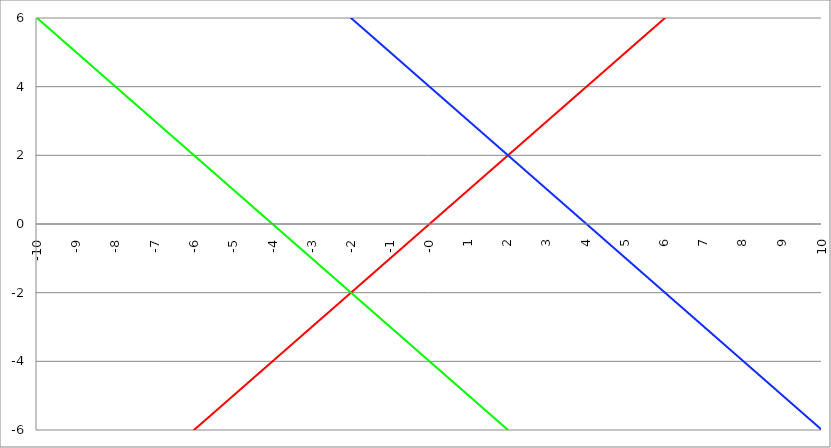
| Category | Series 1 | Series 0 | Series 2 |
|---|---|---|---|
| -10.0 | -10 | 6 | 14 |
| -9.99 | -9.99 | 5.99 | 13.99 |
| -9.98 | -9.98 | 5.98 | 13.98 |
| -9.97 | -9.97 | 5.97 | 13.97 |
| -9.96 | -9.96 | 5.96 | 13.96 |
| -9.95 | -9.95 | 5.95 | 13.95 |
| -9.940000000000001 | -9.94 | 5.94 | 13.94 |
| -9.930000000000001 | -9.93 | 5.93 | 13.93 |
| -9.920000000000002 | -9.92 | 5.92 | 13.92 |
| -9.91 | -9.91 | 5.91 | 13.91 |
| -9.900000000000002 | -9.9 | 5.9 | 13.9 |
| -9.890000000000002 | -9.89 | 5.89 | 13.89 |
| -9.880000000000003 | -9.88 | 5.88 | 13.88 |
| -9.870000000000003 | -9.87 | 5.87 | 13.87 |
| -9.860000000000001 | -9.86 | 5.86 | 13.86 |
| -9.850000000000003 | -9.85 | 5.85 | 13.85 |
| -9.840000000000003 | -9.84 | 5.84 | 13.84 |
| -9.830000000000004 | -9.83 | 5.83 | 13.83 |
| -9.820000000000004 | -9.82 | 5.82 | 13.82 |
| -9.810000000000004 | -9.81 | 5.81 | 13.81 |
| -9.800000000000004 | -9.8 | 5.8 | 13.8 |
| -9.790000000000004 | -9.79 | 5.79 | 13.79 |
| -9.780000000000005 | -9.78 | 5.78 | 13.78 |
| -9.770000000000005 | -9.77 | 5.77 | 13.77 |
| -9.760000000000005 | -9.76 | 5.76 | 13.76 |
| -9.750000000000005 | -9.75 | 5.75 | 13.75 |
| -9.740000000000006 | -9.74 | 5.74 | 13.74 |
| -9.730000000000006 | -9.73 | 5.73 | 13.73 |
| -9.720000000000006 | -9.72 | 5.72 | 13.72 |
| -9.710000000000006 | -9.71 | 5.71 | 13.71 |
| -9.700000000000006 | -9.7 | 5.7 | 13.7 |
| -9.690000000000007 | -9.69 | 5.69 | 13.69 |
| -9.680000000000007 | -9.68 | 5.68 | 13.68 |
| -9.670000000000007 | -9.67 | 5.67 | 13.67 |
| -9.660000000000007 | -9.66 | 5.66 | 13.66 |
| -9.650000000000007 | -9.65 | 5.65 | 13.65 |
| -9.640000000000008 | -9.64 | 5.64 | 13.64 |
| -9.630000000000008 | -9.63 | 5.63 | 13.63 |
| -9.620000000000008 | -9.62 | 5.62 | 13.62 |
| -9.610000000000008 | -9.61 | 5.61 | 13.61 |
| -9.600000000000009 | -9.6 | 5.6 | 13.6 |
| -9.590000000000009 | -9.59 | 5.59 | 13.59 |
| -9.580000000000007 | -9.58 | 5.58 | 13.58 |
| -9.57000000000001 | -9.57 | 5.57 | 13.57 |
| -9.56000000000001 | -9.56 | 5.56 | 13.56 |
| -9.55000000000001 | -9.55 | 5.55 | 13.55 |
| -9.54000000000001 | -9.54 | 5.54 | 13.54 |
| -9.53000000000001 | -9.53 | 5.53 | 13.53 |
| -9.52000000000001 | -9.52 | 5.52 | 13.52 |
| -9.51000000000001 | -9.51 | 5.51 | 13.51 |
| -9.50000000000001 | -9.5 | 5.5 | 13.5 |
| -9.49000000000001 | -9.49 | 5.49 | 13.49 |
| -9.48000000000001 | -9.48 | 5.48 | 13.48 |
| -9.47000000000001 | -9.47 | 5.47 | 13.47 |
| -9.46000000000001 | -9.46 | 5.46 | 13.46 |
| -9.45000000000001 | -9.45 | 5.45 | 13.45 |
| -9.44000000000001 | -9.44 | 5.44 | 13.44 |
| -9.430000000000012 | -9.43 | 5.43 | 13.43 |
| -9.420000000000012 | -9.42 | 5.42 | 13.42 |
| -9.410000000000013 | -9.41 | 5.41 | 13.41 |
| -9.400000000000013 | -9.4 | 5.4 | 13.4 |
| -9.390000000000011 | -9.39 | 5.39 | 13.39 |
| -9.380000000000013 | -9.38 | 5.38 | 13.38 |
| -9.370000000000013 | -9.37 | 5.37 | 13.37 |
| -9.360000000000014 | -9.36 | 5.36 | 13.36 |
| -9.350000000000014 | -9.35 | 5.35 | 13.35 |
| -9.340000000000014 | -9.34 | 5.34 | 13.34 |
| -9.330000000000014 | -9.33 | 5.33 | 13.33 |
| -9.320000000000014 | -9.32 | 5.32 | 13.32 |
| -9.310000000000015 | -9.31 | 5.31 | 13.31 |
| -9.300000000000013 | -9.3 | 5.3 | 13.3 |
| -9.290000000000015 | -9.29 | 5.29 | 13.29 |
| -9.280000000000015 | -9.28 | 5.28 | 13.28 |
| -9.270000000000016 | -9.27 | 5.27 | 13.27 |
| -9.260000000000016 | -9.26 | 5.26 | 13.26 |
| -9.250000000000014 | -9.25 | 5.25 | 13.25 |
| -9.240000000000016 | -9.24 | 5.24 | 13.24 |
| -9.230000000000016 | -9.23 | 5.23 | 13.23 |
| -9.220000000000017 | -9.22 | 5.22 | 13.22 |
| -9.210000000000017 | -9.21 | 5.21 | 13.21 |
| -9.200000000000017 | -9.2 | 5.2 | 13.2 |
| -9.190000000000017 | -9.19 | 5.19 | 13.19 |
| -9.180000000000017 | -9.18 | 5.18 | 13.18 |
| -9.170000000000018 | -9.17 | 5.17 | 13.17 |
| -9.160000000000016 | -9.16 | 5.16 | 13.16 |
| -9.150000000000018 | -9.15 | 5.15 | 13.15 |
| -9.140000000000018 | -9.14 | 5.14 | 13.14 |
| -9.130000000000019 | -9.13 | 5.13 | 13.13 |
| -9.120000000000019 | -9.12 | 5.12 | 13.12 |
| -9.110000000000017 | -9.11 | 5.11 | 13.11 |
| -9.10000000000002 | -9.1 | 5.1 | 13.1 |
| -9.09000000000002 | -9.09 | 5.09 | 13.09 |
| -9.08000000000002 | -9.08 | 5.08 | 13.08 |
| -9.07000000000002 | -9.07 | 5.07 | 13.07 |
| -9.06000000000002 | -9.06 | 5.06 | 13.06 |
| -9.05000000000002 | -9.05 | 5.05 | 13.05 |
| -9.04000000000002 | -9.04 | 5.04 | 13.04 |
| -9.03000000000002 | -9.03 | 5.03 | 13.03 |
| -9.020000000000021 | -9.02 | 5.02 | 13.02 |
| -9.010000000000021 | -9.01 | 5.01 | 13.01 |
| -9.000000000000021 | -9 | 5 | 13 |
| -8.990000000000022 | -8.99 | 4.99 | 12.99 |
| -8.980000000000022 | -8.98 | 4.98 | 12.98 |
| -8.97000000000002 | -8.97 | 4.97 | 12.97 |
| -8.960000000000022 | -8.96 | 4.96 | 12.96 |
| -8.950000000000022 | -8.95 | 4.95 | 12.95 |
| -8.940000000000023 | -8.94 | 4.94 | 12.94 |
| -8.930000000000023 | -8.93 | 4.93 | 12.93 |
| -8.920000000000023 | -8.92 | 4.92 | 12.92 |
| -8.910000000000023 | -8.91 | 4.91 | 12.91 |
| -8.900000000000023 | -8.9 | 4.9 | 12.9 |
| -8.890000000000024 | -8.89 | 4.89 | 12.89 |
| -8.880000000000024 | -8.88 | 4.88 | 12.88 |
| -8.870000000000024 | -8.87 | 4.87 | 12.87 |
| -8.860000000000024 | -8.86 | 4.86 | 12.86 |
| -8.850000000000025 | -8.85 | 4.85 | 12.85 |
| -8.840000000000025 | -8.84 | 4.84 | 12.84 |
| -8.830000000000025 | -8.83 | 4.83 | 12.83 |
| -8.820000000000025 | -8.82 | 4.82 | 12.82 |
| -8.810000000000025 | -8.81 | 4.81 | 12.81 |
| -8.800000000000026 | -8.8 | 4.8 | 12.8 |
| -8.790000000000026 | -8.79 | 4.79 | 12.79 |
| -8.780000000000026 | -8.78 | 4.78 | 12.78 |
| -8.770000000000026 | -8.77 | 4.77 | 12.77 |
| -8.760000000000026 | -8.76 | 4.76 | 12.76 |
| -8.750000000000027 | -8.75 | 4.75 | 12.75 |
| -8.740000000000027 | -8.74 | 4.74 | 12.74 |
| -8.730000000000027 | -8.73 | 4.73 | 12.73 |
| -8.720000000000027 | -8.72 | 4.72 | 12.72 |
| -8.710000000000027 | -8.71 | 4.71 | 12.71 |
| -8.700000000000028 | -8.7 | 4.7 | 12.7 |
| -8.690000000000028 | -8.69 | 4.69 | 12.69 |
| -8.680000000000028 | -8.68 | 4.68 | 12.68 |
| -8.670000000000028 | -8.67 | 4.67 | 12.67 |
| -8.660000000000029 | -8.66 | 4.66 | 12.66 |
| -8.650000000000029 | -8.65 | 4.65 | 12.65 |
| -8.640000000000029 | -8.64 | 4.64 | 12.64 |
| -8.63000000000003 | -8.63 | 4.63 | 12.63 |
| -8.62000000000003 | -8.62 | 4.62 | 12.62 |
| -8.61000000000003 | -8.61 | 4.61 | 12.61 |
| -8.60000000000003 | -8.6 | 4.6 | 12.6 |
| -8.59000000000003 | -8.59 | 4.59 | 12.59 |
| -8.58000000000003 | -8.58 | 4.58 | 12.58 |
| -8.57000000000003 | -8.57 | 4.57 | 12.57 |
| -8.56000000000003 | -8.56 | 4.56 | 12.56 |
| -8.55000000000003 | -8.55 | 4.55 | 12.55 |
| -8.540000000000031 | -8.54 | 4.54 | 12.54 |
| -8.530000000000031 | -8.53 | 4.53 | 12.53 |
| -8.520000000000032 | -8.52 | 4.52 | 12.52 |
| -8.510000000000032 | -8.51 | 4.51 | 12.51 |
| -8.50000000000003 | -8.5 | 4.5 | 12.5 |
| -8.490000000000032 | -8.49 | 4.49 | 12.49 |
| -8.480000000000032 | -8.48 | 4.48 | 12.48 |
| -8.470000000000033 | -8.47 | 4.47 | 12.47 |
| -8.460000000000033 | -8.46 | 4.46 | 12.46 |
| -8.450000000000033 | -8.45 | 4.45 | 12.45 |
| -8.440000000000033 | -8.44 | 4.44 | 12.44 |
| -8.430000000000033 | -8.43 | 4.43 | 12.43 |
| -8.420000000000034 | -8.42 | 4.42 | 12.42 |
| -8.410000000000032 | -8.41 | 4.41 | 12.41 |
| -8.400000000000034 | -8.4 | 4.4 | 12.4 |
| -8.390000000000034 | -8.39 | 4.39 | 12.39 |
| -8.380000000000035 | -8.38 | 4.38 | 12.38 |
| -8.370000000000035 | -8.37 | 4.37 | 12.37 |
| -8.360000000000033 | -8.36 | 4.36 | 12.36 |
| -8.350000000000035 | -8.35 | 4.35 | 12.35 |
| -8.340000000000035 | -8.34 | 4.34 | 12.34 |
| -8.330000000000036 | -8.33 | 4.33 | 12.33 |
| -8.320000000000036 | -8.32 | 4.32 | 12.32 |
| -8.310000000000034 | -8.31 | 4.31 | 12.31 |
| -8.300000000000036 | -8.3 | 4.3 | 12.3 |
| -8.290000000000036 | -8.29 | 4.29 | 12.29 |
| -8.280000000000037 | -8.28 | 4.28 | 12.28 |
| -8.270000000000037 | -8.27 | 4.27 | 12.27 |
| -8.260000000000037 | -8.26 | 4.26 | 12.26 |
| -8.250000000000037 | -8.25 | 4.25 | 12.25 |
| -8.240000000000038 | -8.24 | 4.24 | 12.24 |
| -8.230000000000038 | -8.23 | 4.23 | 12.23 |
| -8.220000000000038 | -8.22 | 4.22 | 12.22 |
| -8.210000000000038 | -8.21 | 4.21 | 12.21 |
| -8.200000000000038 | -8.2 | 4.2 | 12.2 |
| -8.190000000000039 | -8.19 | 4.19 | 12.19 |
| -8.180000000000039 | -8.18 | 4.18 | 12.18 |
| -8.170000000000037 | -8.17 | 4.17 | 12.17 |
| -8.16000000000004 | -8.16 | 4.16 | 12.16 |
| -8.15000000000004 | -8.15 | 4.15 | 12.15 |
| -8.14000000000004 | -8.14 | 4.14 | 12.14 |
| -8.13000000000004 | -8.13 | 4.13 | 12.13 |
| -8.12000000000004 | -8.12 | 4.12 | 12.12 |
| -8.11000000000004 | -8.11 | 4.11 | 12.11 |
| -8.10000000000004 | -8.1 | 4.1 | 12.1 |
| -8.09000000000004 | -8.09 | 4.09 | 12.09 |
| -8.08000000000004 | -8.08 | 4.08 | 12.08 |
| -8.07000000000004 | -8.07 | 4.07 | 12.07 |
| -8.06000000000004 | -8.06 | 4.06 | 12.06 |
| -8.05000000000004 | -8.05 | 4.05 | 12.05 |
| -8.040000000000042 | -8.04 | 4.04 | 12.04 |
| -8.03000000000004 | -8.03 | 4.03 | 12.03 |
| -8.020000000000042 | -8.02 | 4.02 | 12.02 |
| -8.010000000000042 | -8.01 | 4.01 | 12.01 |
| -8.000000000000043 | -8 | 4 | 12 |
| -7.990000000000043 | -7.99 | 3.99 | 11.99 |
| -7.980000000000043 | -7.98 | 3.98 | 11.98 |
| -7.970000000000043 | -7.97 | 3.97 | 11.97 |
| -7.960000000000043 | -7.96 | 3.96 | 11.96 |
| -7.950000000000044 | -7.95 | 3.95 | 11.95 |
| -7.940000000000044 | -7.94 | 3.94 | 11.94 |
| -7.930000000000044 | -7.93 | 3.93 | 11.93 |
| -7.920000000000044 | -7.92 | 3.92 | 11.92 |
| -7.910000000000044 | -7.91 | 3.91 | 11.91 |
| -7.900000000000044 | -7.9 | 3.9 | 11.9 |
| -7.890000000000045 | -7.89 | 3.89 | 11.89 |
| -7.880000000000045 | -7.88 | 3.88 | 11.88 |
| -7.870000000000045 | -7.87 | 3.87 | 11.87 |
| -7.860000000000046 | -7.86 | 3.86 | 11.86 |
| -7.850000000000046 | -7.85 | 3.85 | 11.85 |
| -7.840000000000046 | -7.84 | 3.84 | 11.84 |
| -7.830000000000046 | -7.83 | 3.83 | 11.83 |
| -7.820000000000046 | -7.82 | 3.82 | 11.82 |
| -7.810000000000047 | -7.81 | 3.81 | 11.81 |
| -7.800000000000047 | -7.8 | 3.8 | 11.8 |
| -7.790000000000047 | -7.79 | 3.79 | 11.79 |
| -7.780000000000047 | -7.78 | 3.78 | 11.78 |
| -7.770000000000047 | -7.77 | 3.77 | 11.77 |
| -7.760000000000048 | -7.76 | 3.76 | 11.76 |
| -7.750000000000048 | -7.75 | 3.75 | 11.75 |
| -7.740000000000048 | -7.74 | 3.74 | 11.74 |
| -7.730000000000048 | -7.73 | 3.73 | 11.73 |
| -7.720000000000049 | -7.72 | 3.72 | 11.72 |
| -7.710000000000049 | -7.71 | 3.71 | 11.71 |
| -7.700000000000049 | -7.7 | 3.7 | 11.7 |
| -7.690000000000049 | -7.69 | 3.69 | 11.69 |
| -7.680000000000049 | -7.68 | 3.68 | 11.68 |
| -7.67000000000005 | -7.67 | 3.67 | 11.67 |
| -7.66000000000005 | -7.66 | 3.66 | 11.66 |
| -7.65000000000005 | -7.65 | 3.65 | 11.65 |
| -7.64000000000005 | -7.64 | 3.64 | 11.64 |
| -7.63000000000005 | -7.63 | 3.63 | 11.63 |
| -7.620000000000051 | -7.62 | 3.62 | 11.62 |
| -7.610000000000051 | -7.61 | 3.61 | 11.61 |
| -7.600000000000051 | -7.6 | 3.6 | 11.6 |
| -7.590000000000051 | -7.59 | 3.59 | 11.59 |
| -7.580000000000052 | -7.58 | 3.58 | 11.58 |
| -7.570000000000052 | -7.57 | 3.57 | 11.57 |
| -7.560000000000052 | -7.56 | 3.56 | 11.56 |
| -7.550000000000052 | -7.55 | 3.55 | 11.55 |
| -7.540000000000052 | -7.54 | 3.54 | 11.54 |
| -7.530000000000053 | -7.53 | 3.53 | 11.53 |
| -7.520000000000053 | -7.52 | 3.52 | 11.52 |
| -7.510000000000053 | -7.51 | 3.51 | 11.51 |
| -7.500000000000053 | -7.5 | 3.5 | 11.5 |
| -7.490000000000053 | -7.49 | 3.49 | 11.49 |
| -7.480000000000054 | -7.48 | 3.48 | 11.48 |
| -7.470000000000054 | -7.47 | 3.47 | 11.47 |
| -7.460000000000054 | -7.46 | 3.46 | 11.46 |
| -7.450000000000054 | -7.45 | 3.45 | 11.45 |
| -7.440000000000054 | -7.44 | 3.44 | 11.44 |
| -7.430000000000054 | -7.43 | 3.43 | 11.43 |
| -7.420000000000055 | -7.42 | 3.42 | 11.42 |
| -7.410000000000055 | -7.41 | 3.41 | 11.41 |
| -7.400000000000055 | -7.4 | 3.4 | 11.4 |
| -7.390000000000056 | -7.39 | 3.39 | 11.39 |
| -7.380000000000056 | -7.38 | 3.38 | 11.38 |
| -7.370000000000056 | -7.37 | 3.37 | 11.37 |
| -7.360000000000056 | -7.36 | 3.36 | 11.36 |
| -7.350000000000056 | -7.35 | 3.35 | 11.35 |
| -7.340000000000057 | -7.34 | 3.34 | 11.34 |
| -7.330000000000057 | -7.33 | 3.33 | 11.33 |
| -7.320000000000057 | -7.32 | 3.32 | 11.32 |
| -7.310000000000057 | -7.31 | 3.31 | 11.31 |
| -7.300000000000058 | -7.3 | 3.3 | 11.3 |
| -7.290000000000058 | -7.29 | 3.29 | 11.29 |
| -7.280000000000058 | -7.28 | 3.28 | 11.28 |
| -7.270000000000058 | -7.27 | 3.27 | 11.27 |
| -7.260000000000058 | -7.26 | 3.26 | 11.26 |
| -7.250000000000059 | -7.25 | 3.25 | 11.25 |
| -7.240000000000059 | -7.24 | 3.24 | 11.24 |
| -7.23000000000006 | -7.23 | 3.23 | 11.23 |
| -7.220000000000059 | -7.22 | 3.22 | 11.22 |
| -7.210000000000059 | -7.21 | 3.21 | 11.21 |
| -7.20000000000006 | -7.2 | 3.2 | 11.2 |
| -7.19000000000006 | -7.19 | 3.19 | 11.19 |
| -7.18000000000006 | -7.18 | 3.18 | 11.18 |
| -7.17000000000006 | -7.17 | 3.17 | 11.17 |
| -7.160000000000061 | -7.16 | 3.16 | 11.16 |
| -7.150000000000061 | -7.15 | 3.15 | 11.15 |
| -7.140000000000061 | -7.14 | 3.14 | 11.14 |
| -7.130000000000061 | -7.13 | 3.13 | 11.13 |
| -7.120000000000061 | -7.12 | 3.12 | 11.12 |
| -7.110000000000062 | -7.11 | 3.11 | 11.11 |
| -7.100000000000062 | -7.1 | 3.1 | 11.1 |
| -7.090000000000062 | -7.09 | 3.09 | 11.09 |
| -7.080000000000062 | -7.08 | 3.08 | 11.08 |
| -7.070000000000062 | -7.07 | 3.07 | 11.07 |
| -7.060000000000063 | -7.06 | 3.06 | 11.06 |
| -7.050000000000063 | -7.05 | 3.05 | 11.05 |
| -7.040000000000063 | -7.04 | 3.04 | 11.04 |
| -7.030000000000063 | -7.03 | 3.03 | 11.03 |
| -7.020000000000064 | -7.02 | 3.02 | 11.02 |
| -7.010000000000064 | -7.01 | 3.01 | 11.01 |
| -7.000000000000064 | -7 | 3 | 11 |
| -6.990000000000064 | -6.99 | 2.99 | 10.99 |
| -6.980000000000064 | -6.98 | 2.98 | 10.98 |
| -6.970000000000064 | -6.97 | 2.97 | 10.97 |
| -6.960000000000064 | -6.96 | 2.96 | 10.96 |
| -6.950000000000064 | -6.95 | 2.95 | 10.95 |
| -6.940000000000065 | -6.94 | 2.94 | 10.94 |
| -6.930000000000065 | -6.93 | 2.93 | 10.93 |
| -6.920000000000065 | -6.92 | 2.92 | 10.92 |
| -6.910000000000065 | -6.91 | 2.91 | 10.91 |
| -6.900000000000066 | -6.9 | 2.9 | 10.9 |
| -6.890000000000066 | -6.89 | 2.89 | 10.89 |
| -6.880000000000066 | -6.88 | 2.88 | 10.88 |
| -6.870000000000066 | -6.87 | 2.87 | 10.87 |
| -6.860000000000067 | -6.86 | 2.86 | 10.86 |
| -6.850000000000067 | -6.85 | 2.85 | 10.85 |
| -6.840000000000067 | -6.84 | 2.84 | 10.84 |
| -6.830000000000067 | -6.83 | 2.83 | 10.83 |
| -6.820000000000068 | -6.82 | 2.82 | 10.82 |
| -6.810000000000068 | -6.81 | 2.81 | 10.81 |
| -6.800000000000068 | -6.8 | 2.8 | 10.8 |
| -6.790000000000068 | -6.79 | 2.79 | 10.79 |
| -6.780000000000068 | -6.78 | 2.78 | 10.78 |
| -6.770000000000068 | -6.77 | 2.77 | 10.77 |
| -6.760000000000069 | -6.76 | 2.76 | 10.76 |
| -6.75000000000007 | -6.75 | 2.75 | 10.75 |
| -6.74000000000007 | -6.74 | 2.74 | 10.74 |
| -6.73000000000007 | -6.73 | 2.73 | 10.73 |
| -6.72000000000007 | -6.72 | 2.72 | 10.72 |
| -6.71000000000007 | -6.71 | 2.71 | 10.71 |
| -6.70000000000007 | -6.7 | 2.7 | 10.7 |
| -6.69000000000007 | -6.69 | 2.69 | 10.69 |
| -6.680000000000071 | -6.68 | 2.68 | 10.68 |
| -6.670000000000071 | -6.67 | 2.67 | 10.67 |
| -6.660000000000071 | -6.66 | 2.66 | 10.66 |
| -6.650000000000071 | -6.65 | 2.65 | 10.65 |
| -6.640000000000072 | -6.64 | 2.64 | 10.64 |
| -6.630000000000072 | -6.63 | 2.63 | 10.63 |
| -6.620000000000072 | -6.62 | 2.62 | 10.62 |
| -6.610000000000072 | -6.61 | 2.61 | 10.61 |
| -6.600000000000072 | -6.6 | 2.6 | 10.6 |
| -6.590000000000073 | -6.59 | 2.59 | 10.59 |
| -6.580000000000073 | -6.58 | 2.58 | 10.58 |
| -6.570000000000073 | -6.57 | 2.57 | 10.57 |
| -6.560000000000073 | -6.56 | 2.56 | 10.56 |
| -6.550000000000074 | -6.55 | 2.55 | 10.55 |
| -6.540000000000074 | -6.54 | 2.54 | 10.54 |
| -6.530000000000074 | -6.53 | 2.53 | 10.53 |
| -6.520000000000074 | -6.52 | 2.52 | 10.52 |
| -6.510000000000074 | -6.51 | 2.51 | 10.51 |
| -6.500000000000074 | -6.5 | 2.5 | 10.5 |
| -6.490000000000074 | -6.49 | 2.49 | 10.49 |
| -6.480000000000074 | -6.48 | 2.48 | 10.48 |
| -6.470000000000075 | -6.47 | 2.47 | 10.47 |
| -6.460000000000075 | -6.46 | 2.46 | 10.46 |
| -6.450000000000075 | -6.45 | 2.45 | 10.45 |
| -6.440000000000075 | -6.44 | 2.44 | 10.44 |
| -6.430000000000076 | -6.43 | 2.43 | 10.43 |
| -6.420000000000076 | -6.42 | 2.42 | 10.42 |
| -6.410000000000076 | -6.41 | 2.41 | 10.41 |
| -6.400000000000076 | -6.4 | 2.4 | 10.4 |
| -6.390000000000077 | -6.39 | 2.39 | 10.39 |
| -6.380000000000077 | -6.38 | 2.38 | 10.38 |
| -6.370000000000077 | -6.37 | 2.37 | 10.37 |
| -6.360000000000078 | -6.36 | 2.36 | 10.36 |
| -6.350000000000078 | -6.35 | 2.35 | 10.35 |
| -6.340000000000078 | -6.34 | 2.34 | 10.34 |
| -6.330000000000078 | -6.33 | 2.33 | 10.33 |
| -6.320000000000078 | -6.32 | 2.32 | 10.32 |
| -6.310000000000079 | -6.31 | 2.31 | 10.31 |
| -6.300000000000079 | -6.3 | 2.3 | 10.3 |
| -6.29000000000008 | -6.29 | 2.29 | 10.29 |
| -6.28000000000008 | -6.28 | 2.28 | 10.28 |
| -6.27000000000008 | -6.27 | 2.27 | 10.27 |
| -6.26000000000008 | -6.26 | 2.26 | 10.26 |
| -6.25000000000008 | -6.25 | 2.25 | 10.25 |
| -6.24000000000008 | -6.24 | 2.24 | 10.24 |
| -6.23000000000008 | -6.23 | 2.23 | 10.23 |
| -6.220000000000081 | -6.22 | 2.22 | 10.22 |
| -6.210000000000081 | -6.21 | 2.21 | 10.21 |
| -6.200000000000081 | -6.2 | 2.2 | 10.2 |
| -6.190000000000081 | -6.19 | 2.19 | 10.19 |
| -6.180000000000081 | -6.18 | 2.18 | 10.18 |
| -6.170000000000082 | -6.17 | 2.17 | 10.17 |
| -6.160000000000082 | -6.16 | 2.16 | 10.16 |
| -6.150000000000082 | -6.15 | 2.15 | 10.15 |
| -6.140000000000082 | -6.14 | 2.14 | 10.14 |
| -6.130000000000082 | -6.13 | 2.13 | 10.13 |
| -6.120000000000083 | -6.12 | 2.12 | 10.12 |
| -6.110000000000083 | -6.11 | 2.11 | 10.11 |
| -6.100000000000083 | -6.1 | 2.1 | 10.1 |
| -6.090000000000083 | -6.09 | 2.09 | 10.09 |
| -6.080000000000084 | -6.08 | 2.08 | 10.08 |
| -6.070000000000084 | -6.07 | 2.07 | 10.07 |
| -6.060000000000084 | -6.06 | 2.06 | 10.06 |
| -6.050000000000084 | -6.05 | 2.05 | 10.05 |
| -6.040000000000084 | -6.04 | 2.04 | 10.04 |
| -6.030000000000084 | -6.03 | 2.03 | 10.03 |
| -6.020000000000085 | -6.02 | 2.02 | 10.02 |
| -6.010000000000085 | -6.01 | 2.01 | 10.01 |
| -6.000000000000085 | -6 | 2 | 10 |
| -5.990000000000085 | -5.99 | 1.99 | 9.99 |
| -5.980000000000085 | -5.98 | 1.98 | 9.98 |
| -5.970000000000085 | -5.97 | 1.97 | 9.97 |
| -5.960000000000086 | -5.96 | 1.96 | 9.96 |
| -5.950000000000086 | -5.95 | 1.95 | 9.95 |
| -5.940000000000086 | -5.94 | 1.94 | 9.94 |
| -5.930000000000086 | -5.93 | 1.93 | 9.93 |
| -5.920000000000087 | -5.92 | 1.92 | 9.92 |
| -5.910000000000087 | -5.91 | 1.91 | 9.91 |
| -5.900000000000087 | -5.9 | 1.9 | 9.9 |
| -5.890000000000088 | -5.89 | 1.89 | 9.89 |
| -5.880000000000088 | -5.88 | 1.88 | 9.88 |
| -5.870000000000088 | -5.87 | 1.87 | 9.87 |
| -5.860000000000088 | -5.86 | 1.86 | 9.86 |
| -5.850000000000088 | -5.85 | 1.85 | 9.85 |
| -5.840000000000089 | -5.84 | 1.84 | 9.84 |
| -5.830000000000089 | -5.83 | 1.83 | 9.83 |
| -5.820000000000089 | -5.82 | 1.82 | 9.82 |
| -5.810000000000089 | -5.81 | 1.81 | 9.81 |
| -5.800000000000089 | -5.8 | 1.8 | 9.8 |
| -5.79000000000009 | -5.79 | 1.79 | 9.79 |
| -5.78000000000009 | -5.78 | 1.78 | 9.78 |
| -5.77000000000009 | -5.77 | 1.77 | 9.77 |
| -5.76000000000009 | -5.76 | 1.76 | 9.76 |
| -5.750000000000091 | -5.75 | 1.75 | 9.75 |
| -5.740000000000091 | -5.74 | 1.74 | 9.74 |
| -5.730000000000091 | -5.73 | 1.73 | 9.73 |
| -5.720000000000091 | -5.72 | 1.72 | 9.72 |
| -5.710000000000091 | -5.71 | 1.71 | 9.71 |
| -5.700000000000092 | -5.7 | 1.7 | 9.7 |
| -5.690000000000092 | -5.69 | 1.69 | 9.69 |
| -5.680000000000092 | -5.68 | 1.68 | 9.68 |
| -5.670000000000092 | -5.67 | 1.67 | 9.67 |
| -5.660000000000092 | -5.66 | 1.66 | 9.66 |
| -5.650000000000093 | -5.65 | 1.65 | 9.65 |
| -5.640000000000093 | -5.64 | 1.64 | 9.64 |
| -5.630000000000093 | -5.63 | 1.63 | 9.63 |
| -5.620000000000093 | -5.62 | 1.62 | 9.62 |
| -5.610000000000093 | -5.61 | 1.61 | 9.61 |
| -5.600000000000094 | -5.6 | 1.6 | 9.6 |
| -5.590000000000094 | -5.59 | 1.59 | 9.59 |
| -5.580000000000094 | -5.58 | 1.58 | 9.58 |
| -5.570000000000094 | -5.57 | 1.57 | 9.57 |
| -5.560000000000095 | -5.56 | 1.56 | 9.56 |
| -5.550000000000095 | -5.55 | 1.55 | 9.55 |
| -5.540000000000095 | -5.54 | 1.54 | 9.54 |
| -5.530000000000095 | -5.53 | 1.53 | 9.53 |
| -5.520000000000095 | -5.52 | 1.52 | 9.52 |
| -5.510000000000096 | -5.51 | 1.51 | 9.51 |
| -5.500000000000096 | -5.5 | 1.5 | 9.5 |
| -5.490000000000096 | -5.49 | 1.49 | 9.49 |
| -5.480000000000096 | -5.48 | 1.48 | 9.48 |
| -5.470000000000096 | -5.47 | 1.47 | 9.47 |
| -5.460000000000097 | -5.46 | 1.46 | 9.46 |
| -5.450000000000097 | -5.45 | 1.45 | 9.45 |
| -5.440000000000097 | -5.44 | 1.44 | 9.44 |
| -5.430000000000097 | -5.43 | 1.43 | 9.43 |
| -5.420000000000098 | -5.42 | 1.42 | 9.42 |
| -5.410000000000098 | -5.41 | 1.41 | 9.41 |
| -5.400000000000098 | -5.4 | 1.4 | 9.4 |
| -5.390000000000098 | -5.39 | 1.39 | 9.39 |
| -5.380000000000098 | -5.38 | 1.38 | 9.38 |
| -5.370000000000099 | -5.37 | 1.37 | 9.37 |
| -5.360000000000099 | -5.36 | 1.36 | 9.36 |
| -5.350000000000099 | -5.35 | 1.35 | 9.35 |
| -5.340000000000099 | -5.34 | 1.34 | 9.34 |
| -5.330000000000099 | -5.33 | 1.33 | 9.33 |
| -5.3200000000001 | -5.32 | 1.32 | 9.32 |
| -5.3100000000001 | -5.31 | 1.31 | 9.31 |
| -5.3000000000001 | -5.3 | 1.3 | 9.3 |
| -5.2900000000001 | -5.29 | 1.29 | 9.29 |
| -5.2800000000001 | -5.28 | 1.28 | 9.28 |
| -5.2700000000001 | -5.27 | 1.27 | 9.27 |
| -5.260000000000101 | -5.26 | 1.26 | 9.26 |
| -5.250000000000101 | -5.25 | 1.25 | 9.25 |
| -5.240000000000101 | -5.24 | 1.24 | 9.24 |
| -5.230000000000101 | -5.23 | 1.23 | 9.23 |
| -5.220000000000102 | -5.22 | 1.22 | 9.22 |
| -5.210000000000102 | -5.21 | 1.21 | 9.21 |
| -5.200000000000102 | -5.2 | 1.2 | 9.2 |
| -5.190000000000103 | -5.19 | 1.19 | 9.19 |
| -5.180000000000103 | -5.18 | 1.18 | 9.18 |
| -5.170000000000103 | -5.17 | 1.17 | 9.17 |
| -5.160000000000103 | -5.16 | 1.16 | 9.16 |
| -5.150000000000103 | -5.15 | 1.15 | 9.15 |
| -5.140000000000104 | -5.14 | 1.14 | 9.14 |
| -5.130000000000104 | -5.13 | 1.13 | 9.13 |
| -5.120000000000104 | -5.12 | 1.12 | 9.12 |
| -5.110000000000104 | -5.11 | 1.11 | 9.11 |
| -5.100000000000104 | -5.1 | 1.1 | 9.1 |
| -5.090000000000104 | -5.09 | 1.09 | 9.09 |
| -5.080000000000104 | -5.08 | 1.08 | 9.08 |
| -5.070000000000105 | -5.07 | 1.07 | 9.07 |
| -5.060000000000105 | -5.06 | 1.06 | 9.06 |
| -5.050000000000105 | -5.05 | 1.05 | 9.05 |
| -5.040000000000105 | -5.04 | 1.04 | 9.04 |
| -5.030000000000105 | -5.03 | 1.03 | 9.03 |
| -5.020000000000106 | -5.02 | 1.02 | 9.02 |
| -5.010000000000106 | -5.01 | 1.01 | 9.01 |
| -5.000000000000106 | -5 | 1 | 9 |
| -4.990000000000106 | -4.99 | 0.99 | 8.99 |
| -4.980000000000106 | -4.98 | 0.98 | 8.98 |
| -4.970000000000107 | -4.97 | 0.97 | 8.97 |
| -4.960000000000107 | -4.96 | 0.96 | 8.96 |
| -4.950000000000107 | -4.95 | 0.95 | 8.95 |
| -4.940000000000107 | -4.94 | 0.94 | 8.94 |
| -4.930000000000108 | -4.93 | 0.93 | 8.93 |
| -4.920000000000108 | -4.92 | 0.92 | 8.92 |
| -4.910000000000108 | -4.91 | 0.91 | 8.91 |
| -4.900000000000108 | -4.9 | 0.9 | 8.9 |
| -4.890000000000109 | -4.89 | 0.89 | 8.89 |
| -4.88000000000011 | -4.88 | 0.88 | 8.88 |
| -4.87000000000011 | -4.87 | 0.87 | 8.87 |
| -4.86000000000011 | -4.86 | 0.86 | 8.86 |
| -4.85000000000011 | -4.85 | 0.85 | 8.85 |
| -4.84000000000011 | -4.84 | 0.84 | 8.84 |
| -4.83000000000011 | -4.83 | 0.83 | 8.83 |
| -4.82000000000011 | -4.82 | 0.82 | 8.82 |
| -4.810000000000111 | -4.81 | 0.81 | 8.81 |
| -4.800000000000111 | -4.8 | 0.8 | 8.8 |
| -4.790000000000111 | -4.79 | 0.79 | 8.79 |
| -4.780000000000111 | -4.78 | 0.78 | 8.78 |
| -4.770000000000111 | -4.77 | 0.77 | 8.77 |
| -4.760000000000112 | -4.76 | 0.76 | 8.76 |
| -4.750000000000112 | -4.75 | 0.75 | 8.75 |
| -4.740000000000112 | -4.74 | 0.74 | 8.74 |
| -4.730000000000112 | -4.73 | 0.73 | 8.73 |
| -4.720000000000112 | -4.72 | 0.72 | 8.72 |
| -4.710000000000113 | -4.71 | 0.71 | 8.71 |
| -4.700000000000113 | -4.7 | 0.7 | 8.7 |
| -4.690000000000113 | -4.69 | 0.69 | 8.69 |
| -4.680000000000113 | -4.68 | 0.68 | 8.68 |
| -4.670000000000114 | -4.67 | 0.67 | 8.67 |
| -4.660000000000114 | -4.66 | 0.66 | 8.66 |
| -4.650000000000114 | -4.65 | 0.65 | 8.65 |
| -4.640000000000114 | -4.64 | 0.64 | 8.64 |
| -4.630000000000114 | -4.63 | 0.63 | 8.63 |
| -4.620000000000115 | -4.62 | 0.62 | 8.62 |
| -4.610000000000115 | -4.61 | 0.61 | 8.61 |
| -4.600000000000115 | -4.6 | 0.6 | 8.6 |
| -4.590000000000115 | -4.59 | 0.59 | 8.59 |
| -4.580000000000115 | -4.58 | 0.58 | 8.58 |
| -4.570000000000115 | -4.57 | 0.57 | 8.57 |
| -4.560000000000116 | -4.56 | 0.56 | 8.56 |
| -4.550000000000116 | -4.55 | 0.55 | 8.55 |
| -4.540000000000116 | -4.54 | 0.54 | 8.54 |
| -4.530000000000116 | -4.53 | 0.53 | 8.53 |
| -4.520000000000117 | -4.52 | 0.52 | 8.52 |
| -4.510000000000117 | -4.51 | 0.51 | 8.51 |
| -4.500000000000117 | -4.5 | 0.5 | 8.5 |
| -4.490000000000117 | -4.49 | 0.49 | 8.49 |
| -4.480000000000117 | -4.48 | 0.48 | 8.48 |
| -4.470000000000117 | -4.47 | 0.47 | 8.47 |
| -4.460000000000118 | -4.46 | 0.46 | 8.46 |
| -4.450000000000118 | -4.45 | 0.45 | 8.45 |
| -4.440000000000118 | -4.44 | 0.44 | 8.44 |
| -4.430000000000118 | -4.43 | 0.43 | 8.43 |
| -4.420000000000119 | -4.42 | 0.42 | 8.42 |
| -4.41000000000012 | -4.41 | 0.41 | 8.41 |
| -4.40000000000012 | -4.4 | 0.4 | 8.4 |
| -4.39000000000012 | -4.39 | 0.39 | 8.39 |
| -4.38000000000012 | -4.38 | 0.38 | 8.38 |
| -4.37000000000012 | -4.37 | 0.37 | 8.37 |
| -4.36000000000012 | -4.36 | 0.36 | 8.36 |
| -4.35000000000012 | -4.35 | 0.35 | 8.35 |
| -4.34000000000012 | -4.34 | 0.34 | 8.34 |
| -4.33000000000012 | -4.33 | 0.33 | 8.33 |
| -4.320000000000121 | -4.32 | 0.32 | 8.32 |
| -4.310000000000121 | -4.31 | 0.31 | 8.31 |
| -4.300000000000121 | -4.3 | 0.3 | 8.3 |
| -4.290000000000121 | -4.29 | 0.29 | 8.29 |
| -4.280000000000121 | -4.28 | 0.28 | 8.28 |
| -4.270000000000122 | -4.27 | 0.27 | 8.27 |
| -4.260000000000122 | -4.26 | 0.26 | 8.26 |
| -4.250000000000122 | -4.25 | 0.25 | 8.25 |
| -4.240000000000122 | -4.24 | 0.24 | 8.24 |
| -4.230000000000122 | -4.23 | 0.23 | 8.23 |
| -4.220000000000123 | -4.22 | 0.22 | 8.22 |
| -4.210000000000123 | -4.21 | 0.21 | 8.21 |
| -4.200000000000123 | -4.2 | 0.2 | 8.2 |
| -4.190000000000124 | -4.19 | 0.19 | 8.19 |
| -4.180000000000124 | -4.18 | 0.18 | 8.18 |
| -4.170000000000124 | -4.17 | 0.17 | 8.17 |
| -4.160000000000124 | -4.16 | 0.16 | 8.16 |
| -4.150000000000124 | -4.15 | 0.15 | 8.15 |
| -4.140000000000124 | -4.14 | 0.14 | 8.14 |
| -4.130000000000125 | -4.13 | 0.13 | 8.13 |
| -4.120000000000125 | -4.12 | 0.12 | 8.12 |
| -4.110000000000125 | -4.11 | 0.11 | 8.11 |
| -4.100000000000125 | -4.1 | 0.1 | 8.1 |
| -4.090000000000125 | -4.09 | 0.09 | 8.09 |
| -4.080000000000126 | -4.08 | 0.08 | 8.08 |
| -4.070000000000126 | -4.07 | 0.07 | 8.07 |
| -4.060000000000126 | -4.06 | 0.06 | 8.06 |
| -4.050000000000126 | -4.05 | 0.05 | 8.05 |
| -4.040000000000127 | -4.04 | 0.04 | 8.04 |
| -4.030000000000127 | -4.03 | 0.03 | 8.03 |
| -4.020000000000127 | -4.02 | 0.02 | 8.02 |
| -4.010000000000127 | -4.01 | 0.01 | 8.01 |
| -4.000000000000127 | -4 | 0 | 8 |
| -3.990000000000128 | -3.99 | -0.01 | 7.99 |
| -3.980000000000128 | -3.98 | -0.02 | 7.98 |
| -3.970000000000129 | -3.97 | -0.03 | 7.97 |
| -3.960000000000129 | -3.96 | -0.04 | 7.96 |
| -3.950000000000129 | -3.95 | -0.05 | 7.95 |
| -3.940000000000129 | -3.94 | -0.06 | 7.94 |
| -3.930000000000129 | -3.93 | -0.07 | 7.93 |
| -3.92000000000013 | -3.92 | -0.08 | 7.92 |
| -3.91000000000013 | -3.91 | -0.09 | 7.91 |
| -3.90000000000013 | -3.9 | -0.1 | 7.9 |
| -3.89000000000013 | -3.89 | -0.11 | 7.89 |
| -3.88000000000013 | -3.88 | -0.12 | 7.88 |
| -3.870000000000131 | -3.87 | -0.13 | 7.87 |
| -3.860000000000131 | -3.86 | -0.14 | 7.86 |
| -3.850000000000131 | -3.85 | -0.15 | 7.85 |
| -3.840000000000131 | -3.84 | -0.16 | 7.84 |
| -3.830000000000131 | -3.83 | -0.17 | 7.83 |
| -3.820000000000132 | -3.82 | -0.18 | 7.82 |
| -3.810000000000132 | -3.81 | -0.19 | 7.81 |
| -3.800000000000132 | -3.8 | -0.2 | 7.8 |
| -3.790000000000132 | -3.79 | -0.21 | 7.79 |
| -3.780000000000132 | -3.78 | -0.22 | 7.78 |
| -3.770000000000133 | -3.77 | -0.23 | 7.77 |
| -3.760000000000133 | -3.76 | -0.24 | 7.76 |
| -3.750000000000133 | -3.75 | -0.25 | 7.75 |
| -3.740000000000133 | -3.74 | -0.26 | 7.74 |
| -3.730000000000134 | -3.73 | -0.27 | 7.73 |
| -3.720000000000134 | -3.72 | -0.28 | 7.72 |
| -3.710000000000134 | -3.71 | -0.29 | 7.71 |
| -3.700000000000134 | -3.7 | -0.3 | 7.7 |
| -3.690000000000134 | -3.69 | -0.31 | 7.69 |
| -3.680000000000135 | -3.68 | -0.32 | 7.68 |
| -3.670000000000135 | -3.67 | -0.33 | 7.67 |
| -3.660000000000135 | -3.66 | -0.34 | 7.66 |
| -3.650000000000135 | -3.65 | -0.35 | 7.65 |
| -3.640000000000135 | -3.64 | -0.36 | 7.64 |
| -3.630000000000136 | -3.63 | -0.37 | 7.63 |
| -3.620000000000136 | -3.62 | -0.38 | 7.62 |
| -3.610000000000136 | -3.61 | -0.39 | 7.61 |
| -3.600000000000136 | -3.6 | -0.4 | 7.6 |
| -3.590000000000137 | -3.59 | -0.41 | 7.59 |
| -3.580000000000137 | -3.58 | -0.42 | 7.58 |
| -3.570000000000137 | -3.57 | -0.43 | 7.57 |
| -3.560000000000137 | -3.56 | -0.44 | 7.56 |
| -3.550000000000137 | -3.55 | -0.45 | 7.55 |
| -3.540000000000138 | -3.54 | -0.46 | 7.54 |
| -3.530000000000138 | -3.53 | -0.47 | 7.53 |
| -3.520000000000138 | -3.52 | -0.48 | 7.52 |
| -3.510000000000138 | -3.51 | -0.49 | 7.51 |
| -3.500000000000139 | -3.5 | -0.5 | 7.5 |
| -3.490000000000139 | -3.49 | -0.51 | 7.49 |
| -3.480000000000139 | -3.48 | -0.52 | 7.48 |
| -3.470000000000139 | -3.47 | -0.53 | 7.47 |
| -3.460000000000139 | -3.46 | -0.54 | 7.46 |
| -3.45000000000014 | -3.45 | -0.55 | 7.45 |
| -3.44000000000014 | -3.44 | -0.56 | 7.44 |
| -3.43000000000014 | -3.43 | -0.57 | 7.43 |
| -3.42000000000014 | -3.42 | -0.58 | 7.42 |
| -3.41000000000014 | -3.41 | -0.59 | 7.41 |
| -3.400000000000141 | -3.4 | -0.6 | 7.4 |
| -3.390000000000141 | -3.39 | -0.61 | 7.39 |
| -3.380000000000141 | -3.38 | -0.62 | 7.38 |
| -3.370000000000141 | -3.37 | -0.63 | 7.37 |
| -3.360000000000141 | -3.36 | -0.64 | 7.36 |
| -3.350000000000142 | -3.35 | -0.65 | 7.35 |
| -3.340000000000142 | -3.34 | -0.66 | 7.34 |
| -3.330000000000142 | -3.33 | -0.67 | 7.33 |
| -3.320000000000142 | -3.32 | -0.68 | 7.32 |
| -3.310000000000143 | -3.31 | -0.69 | 7.31 |
| -3.300000000000143 | -3.3 | -0.7 | 7.3 |
| -3.290000000000143 | -3.29 | -0.71 | 7.29 |
| -3.280000000000143 | -3.28 | -0.72 | 7.28 |
| -3.270000000000143 | -3.27 | -0.73 | 7.27 |
| -3.260000000000144 | -3.26 | -0.74 | 7.26 |
| -3.250000000000144 | -3.25 | -0.75 | 7.25 |
| -3.240000000000144 | -3.24 | -0.76 | 7.24 |
| -3.230000000000144 | -3.23 | -0.77 | 7.23 |
| -3.220000000000145 | -3.22 | -0.78 | 7.22 |
| -3.210000000000145 | -3.21 | -0.79 | 7.21 |
| -3.200000000000145 | -3.2 | -0.8 | 7.2 |
| -3.190000000000145 | -3.19 | -0.81 | 7.19 |
| -3.180000000000145 | -3.18 | -0.82 | 7.18 |
| -3.170000000000146 | -3.17 | -0.83 | 7.17 |
| -3.160000000000146 | -3.16 | -0.84 | 7.16 |
| -3.150000000000146 | -3.15 | -0.85 | 7.15 |
| -3.140000000000146 | -3.14 | -0.86 | 7.14 |
| -3.130000000000146 | -3.13 | -0.87 | 7.13 |
| -3.120000000000147 | -3.12 | -0.88 | 7.12 |
| -3.110000000000147 | -3.11 | -0.89 | 7.11 |
| -3.100000000000147 | -3.1 | -0.9 | 7.1 |
| -3.090000000000147 | -3.09 | -0.91 | 7.09 |
| -3.080000000000147 | -3.08 | -0.92 | 7.08 |
| -3.070000000000148 | -3.07 | -0.93 | 7.07 |
| -3.060000000000148 | -3.06 | -0.94 | 7.06 |
| -3.050000000000148 | -3.05 | -0.95 | 7.05 |
| -3.040000000000148 | -3.04 | -0.96 | 7.04 |
| -3.030000000000149 | -3.03 | -0.97 | 7.03 |
| -3.020000000000149 | -3.02 | -0.98 | 7.02 |
| -3.010000000000149 | -3.01 | -0.99 | 7.01 |
| -3.000000000000149 | -3 | -1 | 7 |
| -2.990000000000149 | -2.99 | -1.01 | 6.99 |
| -2.98000000000015 | -2.98 | -1.02 | 6.98 |
| -2.97000000000015 | -2.97 | -1.03 | 6.97 |
| -2.96000000000015 | -2.96 | -1.04 | 6.96 |
| -2.95000000000015 | -2.95 | -1.05 | 6.95 |
| -2.94000000000015 | -2.94 | -1.06 | 6.94 |
| -2.930000000000151 | -2.93 | -1.07 | 6.93 |
| -2.920000000000151 | -2.92 | -1.08 | 6.92 |
| -2.910000000000151 | -2.91 | -1.09 | 6.91 |
| -2.900000000000151 | -2.9 | -1.1 | 6.9 |
| -2.890000000000151 | -2.89 | -1.11 | 6.89 |
| -2.880000000000152 | -2.88 | -1.12 | 6.88 |
| -2.870000000000152 | -2.87 | -1.13 | 6.87 |
| -2.860000000000152 | -2.86 | -1.14 | 6.86 |
| -2.850000000000152 | -2.85 | -1.15 | 6.85 |
| -2.840000000000153 | -2.84 | -1.16 | 6.84 |
| -2.830000000000153 | -2.83 | -1.17 | 6.83 |
| -2.820000000000153 | -2.82 | -1.18 | 6.82 |
| -2.810000000000153 | -2.81 | -1.19 | 6.81 |
| -2.800000000000153 | -2.8 | -1.2 | 6.8 |
| -2.790000000000154 | -2.79 | -1.21 | 6.79 |
| -2.780000000000154 | -2.78 | -1.22 | 6.78 |
| -2.770000000000154 | -2.77 | -1.23 | 6.77 |
| -2.760000000000154 | -2.76 | -1.24 | 6.76 |
| -2.750000000000154 | -2.75 | -1.25 | 6.75 |
| -2.740000000000155 | -2.74 | -1.26 | 6.74 |
| -2.730000000000155 | -2.73 | -1.27 | 6.73 |
| -2.720000000000155 | -2.72 | -1.28 | 6.72 |
| -2.710000000000155 | -2.71 | -1.29 | 6.71 |
| -2.700000000000156 | -2.7 | -1.3 | 6.7 |
| -2.690000000000156 | -2.69 | -1.31 | 6.69 |
| -2.680000000000156 | -2.68 | -1.32 | 6.68 |
| -2.670000000000156 | -2.67 | -1.33 | 6.67 |
| -2.660000000000156 | -2.66 | -1.34 | 6.66 |
| -2.650000000000157 | -2.65 | -1.35 | 6.65 |
| -2.640000000000157 | -2.64 | -1.36 | 6.64 |
| -2.630000000000157 | -2.63 | -1.37 | 6.63 |
| -2.620000000000157 | -2.62 | -1.38 | 6.62 |
| -2.610000000000157 | -2.61 | -1.39 | 6.61 |
| -2.600000000000158 | -2.6 | -1.4 | 6.6 |
| -2.590000000000158 | -2.59 | -1.41 | 6.59 |
| -2.580000000000158 | -2.58 | -1.42 | 6.58 |
| -2.570000000000158 | -2.57 | -1.43 | 6.57 |
| -2.560000000000159 | -2.56 | -1.44 | 6.56 |
| -2.550000000000159 | -2.55 | -1.45 | 6.55 |
| -2.54000000000016 | -2.54 | -1.46 | 6.54 |
| -2.530000000000159 | -2.53 | -1.47 | 6.53 |
| -2.520000000000159 | -2.52 | -1.48 | 6.52 |
| -2.51000000000016 | -2.51 | -1.49 | 6.51 |
| -2.50000000000016 | -2.5 | -1.5 | 6.5 |
| -2.49000000000016 | -2.49 | -1.51 | 6.49 |
| -2.48000000000016 | -2.48 | -1.52 | 6.48 |
| -2.47000000000016 | -2.47 | -1.53 | 6.47 |
| -2.460000000000161 | -2.46 | -1.54 | 6.46 |
| -2.450000000000161 | -2.45 | -1.55 | 6.45 |
| -2.440000000000161 | -2.44 | -1.56 | 6.44 |
| -2.430000000000161 | -2.43 | -1.57 | 6.43 |
| -2.420000000000162 | -2.42 | -1.58 | 6.42 |
| -2.410000000000162 | -2.41 | -1.59 | 6.41 |
| -2.400000000000162 | -2.4 | -1.6 | 6.4 |
| -2.390000000000162 | -2.39 | -1.61 | 6.39 |
| -2.380000000000162 | -2.38 | -1.62 | 6.38 |
| -2.370000000000163 | -2.37 | -1.63 | 6.37 |
| -2.360000000000163 | -2.36 | -1.64 | 6.36 |
| -2.350000000000163 | -2.35 | -1.65 | 6.35 |
| -2.340000000000163 | -2.34 | -1.66 | 6.34 |
| -2.330000000000163 | -2.33 | -1.67 | 6.33 |
| -2.320000000000164 | -2.32 | -1.68 | 6.32 |
| -2.310000000000164 | -2.31 | -1.69 | 6.31 |
| -2.300000000000164 | -2.3 | -1.7 | 6.3 |
| -2.290000000000164 | -2.29 | -1.71 | 6.29 |
| -2.280000000000165 | -2.28 | -1.72 | 6.28 |
| -2.270000000000165 | -2.27 | -1.73 | 6.27 |
| -2.260000000000165 | -2.26 | -1.74 | 6.26 |
| -2.250000000000165 | -2.25 | -1.75 | 6.25 |
| -2.240000000000165 | -2.24 | -1.76 | 6.24 |
| -2.230000000000166 | -2.23 | -1.77 | 6.23 |
| -2.220000000000166 | -2.22 | -1.78 | 6.22 |
| -2.210000000000166 | -2.21 | -1.79 | 6.21 |
| -2.200000000000166 | -2.2 | -1.8 | 6.2 |
| -2.190000000000166 | -2.19 | -1.81 | 6.19 |
| -2.180000000000167 | -2.18 | -1.82 | 6.18 |
| -2.170000000000167 | -2.17 | -1.83 | 6.17 |
| -2.160000000000167 | -2.16 | -1.84 | 6.16 |
| -2.150000000000167 | -2.15 | -1.85 | 6.15 |
| -2.140000000000168 | -2.14 | -1.86 | 6.14 |
| -2.130000000000168 | -2.13 | -1.87 | 6.13 |
| -2.120000000000168 | -2.12 | -1.88 | 6.12 |
| -2.110000000000168 | -2.11 | -1.89 | 6.11 |
| -2.100000000000168 | -2.1 | -1.9 | 6.1 |
| -2.090000000000169 | -2.09 | -1.91 | 6.09 |
| -2.080000000000169 | -2.08 | -1.92 | 6.08 |
| -2.070000000000169 | -2.07 | -1.93 | 6.07 |
| -2.060000000000169 | -2.06 | -1.94 | 6.06 |
| -2.050000000000169 | -2.05 | -1.95 | 6.05 |
| -2.04000000000017 | -2.04 | -1.96 | 6.04 |
| -2.03000000000017 | -2.03 | -1.97 | 6.03 |
| -2.02000000000017 | -2.02 | -1.98 | 6.02 |
| -2.01000000000017 | -2.01 | -1.99 | 6.01 |
| -2.000000000000171 | -2 | -2 | 6 |
| -1.99000000000017 | -1.99 | -2.01 | 5.99 |
| -1.98000000000017 | -1.98 | -2.02 | 5.98 |
| -1.97000000000017 | -1.97 | -2.03 | 5.97 |
| -1.96000000000017 | -1.96 | -2.04 | 5.96 |
| -1.95000000000017 | -1.95 | -2.05 | 5.95 |
| -1.94000000000017 | -1.94 | -2.06 | 5.94 |
| -1.93000000000017 | -1.93 | -2.07 | 5.93 |
| -1.92000000000017 | -1.92 | -2.08 | 5.92 |
| -1.91000000000017 | -1.91 | -2.09 | 5.91 |
| -1.90000000000017 | -1.9 | -2.1 | 5.9 |
| -1.89000000000017 | -1.89 | -2.11 | 5.89 |
| -1.88000000000017 | -1.88 | -2.12 | 5.88 |
| -1.87000000000017 | -1.87 | -2.13 | 5.87 |
| -1.86000000000017 | -1.86 | -2.14 | 5.86 |
| -1.85000000000017 | -1.85 | -2.15 | 5.85 |
| -1.84000000000017 | -1.84 | -2.16 | 5.84 |
| -1.83000000000017 | -1.83 | -2.17 | 5.83 |
| -1.82000000000017 | -1.82 | -2.18 | 5.82 |
| -1.81000000000017 | -1.81 | -2.19 | 5.81 |
| -1.80000000000017 | -1.8 | -2.2 | 5.8 |
| -1.79000000000017 | -1.79 | -2.21 | 5.79 |
| -1.78000000000017 | -1.78 | -2.22 | 5.78 |
| -1.77000000000017 | -1.77 | -2.23 | 5.77 |
| -1.76000000000017 | -1.76 | -2.24 | 5.76 |
| -1.75000000000017 | -1.75 | -2.25 | 5.75 |
| -1.74000000000017 | -1.74 | -2.26 | 5.74 |
| -1.73000000000017 | -1.73 | -2.27 | 5.73 |
| -1.72000000000017 | -1.72 | -2.28 | 5.72 |
| -1.71000000000017 | -1.71 | -2.29 | 5.71 |
| -1.70000000000017 | -1.7 | -2.3 | 5.7 |
| -1.69000000000017 | -1.69 | -2.31 | 5.69 |
| -1.68000000000017 | -1.68 | -2.32 | 5.68 |
| -1.67000000000017 | -1.67 | -2.33 | 5.67 |
| -1.66000000000017 | -1.66 | -2.34 | 5.66 |
| -1.65000000000017 | -1.65 | -2.35 | 5.65 |
| -1.64000000000017 | -1.64 | -2.36 | 5.64 |
| -1.63000000000017 | -1.63 | -2.37 | 5.63 |
| -1.62000000000017 | -1.62 | -2.38 | 5.62 |
| -1.61000000000017 | -1.61 | -2.39 | 5.61 |
| -1.60000000000017 | -1.6 | -2.4 | 5.6 |
| -1.59000000000017 | -1.59 | -2.41 | 5.59 |
| -1.58000000000017 | -1.58 | -2.42 | 5.58 |
| -1.57000000000017 | -1.57 | -2.43 | 5.57 |
| -1.56000000000017 | -1.56 | -2.44 | 5.56 |
| -1.55000000000017 | -1.55 | -2.45 | 5.55 |
| -1.54000000000017 | -1.54 | -2.46 | 5.54 |
| -1.53000000000017 | -1.53 | -2.47 | 5.53 |
| -1.52000000000017 | -1.52 | -2.48 | 5.52 |
| -1.51000000000017 | -1.51 | -2.49 | 5.51 |
| -1.50000000000017 | -1.5 | -2.5 | 5.5 |
| -1.49000000000017 | -1.49 | -2.51 | 5.49 |
| -1.48000000000017 | -1.48 | -2.52 | 5.48 |
| -1.47000000000017 | -1.47 | -2.53 | 5.47 |
| -1.46000000000017 | -1.46 | -2.54 | 5.46 |
| -1.45000000000017 | -1.45 | -2.55 | 5.45 |
| -1.44000000000017 | -1.44 | -2.56 | 5.44 |
| -1.43000000000017 | -1.43 | -2.57 | 5.43 |
| -1.42000000000017 | -1.42 | -2.58 | 5.42 |
| -1.41000000000017 | -1.41 | -2.59 | 5.41 |
| -1.40000000000017 | -1.4 | -2.6 | 5.4 |
| -1.39000000000017 | -1.39 | -2.61 | 5.39 |
| -1.38000000000017 | -1.38 | -2.62 | 5.38 |
| -1.37000000000017 | -1.37 | -2.63 | 5.37 |
| -1.36000000000017 | -1.36 | -2.64 | 5.36 |
| -1.35000000000017 | -1.35 | -2.65 | 5.35 |
| -1.34000000000017 | -1.34 | -2.66 | 5.34 |
| -1.33000000000017 | -1.33 | -2.67 | 5.33 |
| -1.32000000000017 | -1.32 | -2.68 | 5.32 |
| -1.31000000000017 | -1.31 | -2.69 | 5.31 |
| -1.30000000000017 | -1.3 | -2.7 | 5.3 |
| -1.29000000000017 | -1.29 | -2.71 | 5.29 |
| -1.28000000000017 | -1.28 | -2.72 | 5.28 |
| -1.27000000000017 | -1.27 | -2.73 | 5.27 |
| -1.26000000000017 | -1.26 | -2.74 | 5.26 |
| -1.25000000000017 | -1.25 | -2.75 | 5.25 |
| -1.24000000000017 | -1.24 | -2.76 | 5.24 |
| -1.23000000000017 | -1.23 | -2.77 | 5.23 |
| -1.22000000000017 | -1.22 | -2.78 | 5.22 |
| -1.21000000000017 | -1.21 | -2.79 | 5.21 |
| -1.20000000000017 | -1.2 | -2.8 | 5.2 |
| -1.19000000000017 | -1.19 | -2.81 | 5.19 |
| -1.18000000000017 | -1.18 | -2.82 | 5.18 |
| -1.17000000000017 | -1.17 | -2.83 | 5.17 |
| -1.16000000000017 | -1.16 | -2.84 | 5.16 |
| -1.15000000000017 | -1.15 | -2.85 | 5.15 |
| -1.14000000000017 | -1.14 | -2.86 | 5.14 |
| -1.13000000000017 | -1.13 | -2.87 | 5.13 |
| -1.12000000000017 | -1.12 | -2.88 | 5.12 |
| -1.11000000000017 | -1.11 | -2.89 | 5.11 |
| -1.10000000000017 | -1.1 | -2.9 | 5.1 |
| -1.09000000000017 | -1.09 | -2.91 | 5.09 |
| -1.08000000000017 | -1.08 | -2.92 | 5.08 |
| -1.07000000000017 | -1.07 | -2.93 | 5.07 |
| -1.06000000000017 | -1.06 | -2.94 | 5.06 |
| -1.05000000000017 | -1.05 | -2.95 | 5.05 |
| -1.04000000000017 | -1.04 | -2.96 | 5.04 |
| -1.03000000000017 | -1.03 | -2.97 | 5.03 |
| -1.02000000000017 | -1.02 | -2.98 | 5.02 |
| -1.01000000000017 | -1.01 | -2.99 | 5.01 |
| -1.00000000000017 | -1 | -3 | 5 |
| -0.99000000000017 | -0.99 | -3.01 | 4.99 |
| -0.98000000000017 | -0.98 | -3.02 | 4.98 |
| -0.97000000000017 | -0.97 | -3.03 | 4.97 |
| -0.96000000000017 | -0.96 | -3.04 | 4.96 |
| -0.95000000000017 | -0.95 | -3.05 | 4.95 |
| -0.94000000000017 | -0.94 | -3.06 | 4.94 |
| -0.93000000000017 | -0.93 | -3.07 | 4.93 |
| -0.92000000000017 | -0.92 | -3.08 | 4.92 |
| -0.91000000000017 | -0.91 | -3.09 | 4.91 |
| -0.90000000000017 | -0.9 | -3.1 | 4.9 |
| -0.890000000000169 | -0.89 | -3.11 | 4.89 |
| -0.880000000000169 | -0.88 | -3.12 | 4.88 |
| -0.870000000000169 | -0.87 | -3.13 | 4.87 |
| -0.860000000000169 | -0.86 | -3.14 | 4.86 |
| -0.850000000000169 | -0.85 | -3.15 | 4.85 |
| -0.840000000000169 | -0.84 | -3.16 | 4.84 |
| -0.830000000000169 | -0.83 | -3.17 | 4.83 |
| -0.820000000000169 | -0.82 | -3.18 | 4.82 |
| -0.810000000000169 | -0.81 | -3.19 | 4.81 |
| -0.800000000000169 | -0.8 | -3.2 | 4.8 |
| -0.790000000000169 | -0.79 | -3.21 | 4.79 |
| -0.780000000000169 | -0.78 | -3.22 | 4.78 |
| -0.770000000000169 | -0.77 | -3.23 | 4.77 |
| -0.760000000000169 | -0.76 | -3.24 | 4.76 |
| -0.750000000000169 | -0.75 | -3.25 | 4.75 |
| -0.740000000000169 | -0.74 | -3.26 | 4.74 |
| -0.730000000000169 | -0.73 | -3.27 | 4.73 |
| -0.720000000000169 | -0.72 | -3.28 | 4.72 |
| -0.710000000000169 | -0.71 | -3.29 | 4.71 |
| -0.700000000000169 | -0.7 | -3.3 | 4.7 |
| -0.690000000000169 | -0.69 | -3.31 | 4.69 |
| -0.680000000000169 | -0.68 | -3.32 | 4.68 |
| -0.670000000000169 | -0.67 | -3.33 | 4.67 |
| -0.660000000000169 | -0.66 | -3.34 | 4.66 |
| -0.650000000000169 | -0.65 | -3.35 | 4.65 |
| -0.640000000000169 | -0.64 | -3.36 | 4.64 |
| -0.630000000000169 | -0.63 | -3.37 | 4.63 |
| -0.620000000000169 | -0.62 | -3.38 | 4.62 |
| -0.610000000000169 | -0.61 | -3.39 | 4.61 |
| -0.600000000000169 | -0.6 | -3.4 | 4.6 |
| -0.590000000000169 | -0.59 | -3.41 | 4.59 |
| -0.580000000000169 | -0.58 | -3.42 | 4.58 |
| -0.570000000000169 | -0.57 | -3.43 | 4.57 |
| -0.560000000000169 | -0.56 | -3.44 | 4.56 |
| -0.550000000000169 | -0.55 | -3.45 | 4.55 |
| -0.540000000000169 | -0.54 | -3.46 | 4.54 |
| -0.530000000000169 | -0.53 | -3.47 | 4.53 |
| -0.520000000000169 | -0.52 | -3.48 | 4.52 |
| -0.510000000000169 | -0.51 | -3.49 | 4.51 |
| -0.500000000000169 | -0.5 | -3.5 | 4.5 |
| -0.490000000000169 | -0.49 | -3.51 | 4.49 |
| -0.480000000000169 | -0.48 | -3.52 | 4.48 |
| -0.470000000000169 | -0.47 | -3.53 | 4.47 |
| -0.460000000000169 | -0.46 | -3.54 | 4.46 |
| -0.450000000000169 | -0.45 | -3.55 | 4.45 |
| -0.440000000000169 | -0.44 | -3.56 | 4.44 |
| -0.430000000000169 | -0.43 | -3.57 | 4.43 |
| -0.420000000000169 | -0.42 | -3.58 | 4.42 |
| -0.410000000000169 | -0.41 | -3.59 | 4.41 |
| -0.400000000000169 | -0.4 | -3.6 | 4.4 |
| -0.390000000000169 | -0.39 | -3.61 | 4.39 |
| -0.380000000000169 | -0.38 | -3.62 | 4.38 |
| -0.370000000000169 | -0.37 | -3.63 | 4.37 |
| -0.360000000000169 | -0.36 | -3.64 | 4.36 |
| -0.350000000000169 | -0.35 | -3.65 | 4.35 |
| -0.340000000000169 | -0.34 | -3.66 | 4.34 |
| -0.330000000000169 | -0.33 | -3.67 | 4.33 |
| -0.320000000000169 | -0.32 | -3.68 | 4.32 |
| -0.310000000000169 | -0.31 | -3.69 | 4.31 |
| -0.300000000000169 | -0.3 | -3.7 | 4.3 |
| -0.290000000000169 | -0.29 | -3.71 | 4.29 |
| -0.280000000000169 | -0.28 | -3.72 | 4.28 |
| -0.270000000000169 | -0.27 | -3.73 | 4.27 |
| -0.260000000000169 | -0.26 | -3.74 | 4.26 |
| -0.250000000000169 | -0.25 | -3.75 | 4.25 |
| -0.240000000000169 | -0.24 | -3.76 | 4.24 |
| -0.230000000000169 | -0.23 | -3.77 | 4.23 |
| -0.220000000000169 | -0.22 | -3.78 | 4.22 |
| -0.210000000000169 | -0.21 | -3.79 | 4.21 |
| -0.200000000000169 | -0.2 | -3.8 | 4.2 |
| -0.190000000000169 | -0.19 | -3.81 | 4.19 |
| -0.180000000000169 | -0.18 | -3.82 | 4.18 |
| -0.170000000000169 | -0.17 | -3.83 | 4.17 |
| -0.160000000000169 | -0.16 | -3.84 | 4.16 |
| -0.150000000000169 | -0.15 | -3.85 | 4.15 |
| -0.140000000000169 | -0.14 | -3.86 | 4.14 |
| -0.130000000000169 | -0.13 | -3.87 | 4.13 |
| -0.120000000000169 | -0.12 | -3.88 | 4.12 |
| -0.110000000000169 | -0.11 | -3.89 | 4.11 |
| -0.100000000000169 | -0.1 | -3.9 | 4.1 |
| -0.0900000000001689 | -0.09 | -3.91 | 4.09 |
| -0.0800000000001689 | -0.08 | -3.92 | 4.08 |
| -0.0700000000001689 | -0.07 | -3.93 | 4.07 |
| -0.0600000000001689 | -0.06 | -3.94 | 4.06 |
| -0.0500000000001689 | -0.05 | -3.95 | 4.05 |
| -0.0400000000001689 | -0.04 | -3.96 | 4.04 |
| -0.0300000000001689 | -0.03 | -3.97 | 4.03 |
| -0.0200000000001689 | -0.02 | -3.98 | 4.02 |
| -0.0100000000001689 | -0.01 | -3.99 | 4.01 |
| -1.6888920817415e-13 | 0 | -4 | 4 |
| 0.00999999999983111 | 0.01 | -4.01 | 3.99 |
| 0.0199999999998311 | 0.02 | -4.02 | 3.98 |
| 0.0299999999998311 | 0.03 | -4.03 | 3.97 |
| 0.0399999999998311 | 0.04 | -4.04 | 3.96 |
| 0.0499999999998311 | 0.05 | -4.05 | 3.95 |
| 0.0599999999998311 | 0.06 | -4.06 | 3.94 |
| 0.0699999999998311 | 0.07 | -4.07 | 3.93 |
| 0.0799999999998311 | 0.08 | -4.08 | 3.92 |
| 0.0899999999998311 | 0.09 | -4.09 | 3.91 |
| 0.0999999999998311 | 0.1 | -4.1 | 3.9 |
| 0.109999999999831 | 0.11 | -4.11 | 3.89 |
| 0.119999999999831 | 0.12 | -4.12 | 3.88 |
| 0.129999999999831 | 0.13 | -4.13 | 3.87 |
| 0.139999999999831 | 0.14 | -4.14 | 3.86 |
| 0.149999999999831 | 0.15 | -4.15 | 3.85 |
| 0.159999999999831 | 0.16 | -4.16 | 3.84 |
| 0.169999999999831 | 0.17 | -4.17 | 3.83 |
| 0.179999999999831 | 0.18 | -4.18 | 3.82 |
| 0.189999999999831 | 0.19 | -4.19 | 3.81 |
| 0.199999999999831 | 0.2 | -4.2 | 3.8 |
| 0.209999999999831 | 0.21 | -4.21 | 3.79 |
| 0.219999999999831 | 0.22 | -4.22 | 3.78 |
| 0.229999999999831 | 0.23 | -4.23 | 3.77 |
| 0.239999999999831 | 0.24 | -4.24 | 3.76 |
| 0.249999999999831 | 0.25 | -4.25 | 3.75 |
| 0.259999999999831 | 0.26 | -4.26 | 3.74 |
| 0.269999999999831 | 0.27 | -4.27 | 3.73 |
| 0.279999999999831 | 0.28 | -4.28 | 3.72 |
| 0.289999999999831 | 0.29 | -4.29 | 3.71 |
| 0.299999999999831 | 0.3 | -4.3 | 3.7 |
| 0.309999999999831 | 0.31 | -4.31 | 3.69 |
| 0.319999999999831 | 0.32 | -4.32 | 3.68 |
| 0.329999999999831 | 0.33 | -4.33 | 3.67 |
| 0.339999999999831 | 0.34 | -4.34 | 3.66 |
| 0.349999999999831 | 0.35 | -4.35 | 3.65 |
| 0.359999999999831 | 0.36 | -4.36 | 3.64 |
| 0.369999999999831 | 0.37 | -4.37 | 3.63 |
| 0.379999999999831 | 0.38 | -4.38 | 3.62 |
| 0.389999999999831 | 0.39 | -4.39 | 3.61 |
| 0.399999999999831 | 0.4 | -4.4 | 3.6 |
| 0.409999999999831 | 0.41 | -4.41 | 3.59 |
| 0.419999999999831 | 0.42 | -4.42 | 3.58 |
| 0.429999999999831 | 0.43 | -4.43 | 3.57 |
| 0.439999999999831 | 0.44 | -4.44 | 3.56 |
| 0.449999999999831 | 0.45 | -4.45 | 3.55 |
| 0.459999999999831 | 0.46 | -4.46 | 3.54 |
| 0.469999999999831 | 0.47 | -4.47 | 3.53 |
| 0.479999999999831 | 0.48 | -4.48 | 3.52 |
| 0.489999999999831 | 0.49 | -4.49 | 3.51 |
| 0.499999999999831 | 0.5 | -4.5 | 3.5 |
| 0.509999999999831 | 0.51 | -4.51 | 3.49 |
| 0.519999999999831 | 0.52 | -4.52 | 3.48 |
| 0.529999999999831 | 0.53 | -4.53 | 3.47 |
| 0.539999999999831 | 0.54 | -4.54 | 3.46 |
| 0.549999999999831 | 0.55 | -4.55 | 3.45 |
| 0.559999999999831 | 0.56 | -4.56 | 3.44 |
| 0.569999999999831 | 0.57 | -4.57 | 3.43 |
| 0.579999999999831 | 0.58 | -4.58 | 3.42 |
| 0.589999999999831 | 0.59 | -4.59 | 3.41 |
| 0.599999999999831 | 0.6 | -4.6 | 3.4 |
| 0.609999999999831 | 0.61 | -4.61 | 3.39 |
| 0.619999999999831 | 0.62 | -4.62 | 3.38 |
| 0.629999999999831 | 0.63 | -4.63 | 3.37 |
| 0.639999999999831 | 0.64 | -4.64 | 3.36 |
| 0.649999999999831 | 0.65 | -4.65 | 3.35 |
| 0.659999999999831 | 0.66 | -4.66 | 3.34 |
| 0.669999999999831 | 0.67 | -4.67 | 3.33 |
| 0.679999999999831 | 0.68 | -4.68 | 3.32 |
| 0.689999999999831 | 0.69 | -4.69 | 3.31 |
| 0.699999999999831 | 0.7 | -4.7 | 3.3 |
| 0.709999999999831 | 0.71 | -4.71 | 3.29 |
| 0.719999999999831 | 0.72 | -4.72 | 3.28 |
| 0.729999999999831 | 0.73 | -4.73 | 3.27 |
| 0.739999999999831 | 0.74 | -4.74 | 3.26 |
| 0.749999999999832 | 0.75 | -4.75 | 3.25 |
| 0.759999999999832 | 0.76 | -4.76 | 3.24 |
| 0.769999999999832 | 0.77 | -4.77 | 3.23 |
| 0.779999999999832 | 0.78 | -4.78 | 3.22 |
| 0.789999999999832 | 0.79 | -4.79 | 3.21 |
| 0.799999999999832 | 0.8 | -4.8 | 3.2 |
| 0.809999999999832 | 0.81 | -4.81 | 3.19 |
| 0.819999999999832 | 0.82 | -4.82 | 3.18 |
| 0.829999999999832 | 0.83 | -4.83 | 3.17 |
| 0.839999999999832 | 0.84 | -4.84 | 3.16 |
| 0.849999999999832 | 0.85 | -4.85 | 3.15 |
| 0.859999999999832 | 0.86 | -4.86 | 3.14 |
| 0.869999999999832 | 0.87 | -4.87 | 3.13 |
| 0.879999999999832 | 0.88 | -4.88 | 3.12 |
| 0.889999999999832 | 0.89 | -4.89 | 3.11 |
| 0.899999999999832 | 0.9 | -4.9 | 3.1 |
| 0.909999999999832 | 0.91 | -4.91 | 3.09 |
| 0.919999999999832 | 0.92 | -4.92 | 3.08 |
| 0.929999999999832 | 0.93 | -4.93 | 3.07 |
| 0.939999999999832 | 0.94 | -4.94 | 3.06 |
| 0.949999999999832 | 0.95 | -4.95 | 3.05 |
| 0.959999999999832 | 0.96 | -4.96 | 3.04 |
| 0.969999999999832 | 0.97 | -4.97 | 3.03 |
| 0.979999999999832 | 0.98 | -4.98 | 3.02 |
| 0.989999999999832 | 0.99 | -4.99 | 3.01 |
| 0.999999999999832 | 1 | -5 | 3 |
| 1.009999999999832 | 1.01 | -5.01 | 2.99 |
| 1.019999999999832 | 1.02 | -5.02 | 2.98 |
| 1.029999999999832 | 1.03 | -5.03 | 2.97 |
| 1.039999999999832 | 1.04 | -5.04 | 2.96 |
| 1.049999999999832 | 1.05 | -5.05 | 2.95 |
| 1.059999999999832 | 1.06 | -5.06 | 2.94 |
| 1.069999999999832 | 1.07 | -5.07 | 2.93 |
| 1.079999999999832 | 1.08 | -5.08 | 2.92 |
| 1.089999999999832 | 1.09 | -5.09 | 2.91 |
| 1.099999999999832 | 1.1 | -5.1 | 2.9 |
| 1.109999999999832 | 1.11 | -5.11 | 2.89 |
| 1.119999999999832 | 1.12 | -5.12 | 2.88 |
| 1.129999999999832 | 1.13 | -5.13 | 2.87 |
| 1.139999999999832 | 1.14 | -5.14 | 2.86 |
| 1.149999999999832 | 1.15 | -5.15 | 2.85 |
| 1.159999999999832 | 1.16 | -5.16 | 2.84 |
| 1.169999999999832 | 1.17 | -5.17 | 2.83 |
| 1.179999999999832 | 1.18 | -5.18 | 2.82 |
| 1.189999999999832 | 1.19 | -5.19 | 2.81 |
| 1.199999999999832 | 1.2 | -5.2 | 2.8 |
| 1.209999999999832 | 1.21 | -5.21 | 2.79 |
| 1.219999999999832 | 1.22 | -5.22 | 2.78 |
| 1.229999999999832 | 1.23 | -5.23 | 2.77 |
| 1.239999999999832 | 1.24 | -5.24 | 2.76 |
| 1.249999999999832 | 1.25 | -5.25 | 2.75 |
| 1.259999999999832 | 1.26 | -5.26 | 2.74 |
| 1.269999999999832 | 1.27 | -5.27 | 2.73 |
| 1.279999999999832 | 1.28 | -5.28 | 2.72 |
| 1.289999999999832 | 1.29 | -5.29 | 2.71 |
| 1.299999999999832 | 1.3 | -5.3 | 2.7 |
| 1.309999999999832 | 1.31 | -5.31 | 2.69 |
| 1.319999999999832 | 1.32 | -5.32 | 2.68 |
| 1.329999999999832 | 1.33 | -5.33 | 2.67 |
| 1.339999999999832 | 1.34 | -5.34 | 2.66 |
| 1.349999999999832 | 1.35 | -5.35 | 2.65 |
| 1.359999999999832 | 1.36 | -5.36 | 2.64 |
| 1.369999999999832 | 1.37 | -5.37 | 2.63 |
| 1.379999999999832 | 1.38 | -5.38 | 2.62 |
| 1.389999999999832 | 1.39 | -5.39 | 2.61 |
| 1.399999999999832 | 1.4 | -5.4 | 2.6 |
| 1.409999999999832 | 1.41 | -5.41 | 2.59 |
| 1.419999999999832 | 1.42 | -5.42 | 2.58 |
| 1.429999999999832 | 1.43 | -5.43 | 2.57 |
| 1.439999999999832 | 1.44 | -5.44 | 2.56 |
| 1.449999999999832 | 1.45 | -5.45 | 2.55 |
| 1.459999999999832 | 1.46 | -5.46 | 2.54 |
| 1.469999999999832 | 1.47 | -5.47 | 2.53 |
| 1.479999999999832 | 1.48 | -5.48 | 2.52 |
| 1.489999999999832 | 1.49 | -5.49 | 2.51 |
| 1.499999999999832 | 1.5 | -5.5 | 2.5 |
| 1.509999999999832 | 1.51 | -5.51 | 2.49 |
| 1.519999999999832 | 1.52 | -5.52 | 2.48 |
| 1.529999999999832 | 1.53 | -5.53 | 2.47 |
| 1.539999999999832 | 1.54 | -5.54 | 2.46 |
| 1.549999999999832 | 1.55 | -5.55 | 2.45 |
| 1.559999999999832 | 1.56 | -5.56 | 2.44 |
| 1.569999999999832 | 1.57 | -5.57 | 2.43 |
| 1.579999999999832 | 1.58 | -5.58 | 2.42 |
| 1.589999999999832 | 1.59 | -5.59 | 2.41 |
| 1.599999999999832 | 1.6 | -5.6 | 2.4 |
| 1.609999999999832 | 1.61 | -5.61 | 2.39 |
| 1.619999999999832 | 1.62 | -5.62 | 2.38 |
| 1.629999999999832 | 1.63 | -5.63 | 2.37 |
| 1.639999999999832 | 1.64 | -5.64 | 2.36 |
| 1.649999999999832 | 1.65 | -5.65 | 2.35 |
| 1.659999999999832 | 1.66 | -5.66 | 2.34 |
| 1.669999999999832 | 1.67 | -5.67 | 2.33 |
| 1.679999999999832 | 1.68 | -5.68 | 2.32 |
| 1.689999999999832 | 1.69 | -5.69 | 2.31 |
| 1.699999999999832 | 1.7 | -5.7 | 2.3 |
| 1.709999999999832 | 1.71 | -5.71 | 2.29 |
| 1.719999999999832 | 1.72 | -5.72 | 2.28 |
| 1.729999999999832 | 1.73 | -5.73 | 2.27 |
| 1.739999999999832 | 1.74 | -5.74 | 2.26 |
| 1.749999999999832 | 1.75 | -5.75 | 2.25 |
| 1.759999999999832 | 1.76 | -5.76 | 2.24 |
| 1.769999999999832 | 1.77 | -5.77 | 2.23 |
| 1.779999999999832 | 1.78 | -5.78 | 2.22 |
| 1.789999999999832 | 1.79 | -5.79 | 2.21 |
| 1.799999999999832 | 1.8 | -5.8 | 2.2 |
| 1.809999999999832 | 1.81 | -5.81 | 2.19 |
| 1.819999999999832 | 1.82 | -5.82 | 2.18 |
| 1.829999999999832 | 1.83 | -5.83 | 2.17 |
| 1.839999999999832 | 1.84 | -5.84 | 2.16 |
| 1.849999999999832 | 1.85 | -5.85 | 2.15 |
| 1.859999999999832 | 1.86 | -5.86 | 2.14 |
| 1.869999999999832 | 1.87 | -5.87 | 2.13 |
| 1.879999999999832 | 1.88 | -5.88 | 2.12 |
| 1.889999999999832 | 1.89 | -5.89 | 2.11 |
| 1.899999999999832 | 1.9 | -5.9 | 2.1 |
| 1.909999999999832 | 1.91 | -5.91 | 2.09 |
| 1.919999999999832 | 1.92 | -5.92 | 2.08 |
| 1.929999999999832 | 1.93 | -5.93 | 2.07 |
| 1.939999999999832 | 1.94 | -5.94 | 2.06 |
| 1.949999999999833 | 1.95 | -5.95 | 2.05 |
| 1.959999999999833 | 1.96 | -5.96 | 2.04 |
| 1.969999999999833 | 1.97 | -5.97 | 2.03 |
| 1.979999999999833 | 1.98 | -5.98 | 2.02 |
| 1.989999999999833 | 1.99 | -5.99 | 2.01 |
| 1.999999999999833 | 2 | -6 | 2 |
| 2.009999999999832 | 2.01 | -6.01 | 1.99 |
| 2.019999999999832 | 2.02 | -6.02 | 1.98 |
| 2.029999999999832 | 2.03 | -6.03 | 1.97 |
| 2.039999999999832 | 2.04 | -6.04 | 1.96 |
| 2.049999999999832 | 2.05 | -6.05 | 1.95 |
| 2.059999999999831 | 2.06 | -6.06 | 1.94 |
| 2.069999999999831 | 2.07 | -6.07 | 1.93 |
| 2.079999999999831 | 2.08 | -6.08 | 1.92 |
| 2.089999999999831 | 2.09 | -6.09 | 1.91 |
| 2.09999999999983 | 2.1 | -6.1 | 1.9 |
| 2.10999999999983 | 2.11 | -6.11 | 1.89 |
| 2.11999999999983 | 2.12 | -6.12 | 1.88 |
| 2.12999999999983 | 2.13 | -6.13 | 1.87 |
| 2.13999999999983 | 2.14 | -6.14 | 1.86 |
| 2.149999999999829 | 2.15 | -6.15 | 1.85 |
| 2.159999999999829 | 2.16 | -6.16 | 1.84 |
| 2.169999999999829 | 2.17 | -6.17 | 1.83 |
| 2.179999999999829 | 2.18 | -6.18 | 1.82 |
| 2.189999999999829 | 2.19 | -6.19 | 1.81 |
| 2.199999999999828 | 2.2 | -6.2 | 1.8 |
| 2.209999999999828 | 2.21 | -6.21 | 1.79 |
| 2.219999999999828 | 2.22 | -6.22 | 1.78 |
| 2.229999999999828 | 2.23 | -6.23 | 1.77 |
| 2.239999999999827 | 2.24 | -6.24 | 1.76 |
| 2.249999999999827 | 2.25 | -6.25 | 1.75 |
| 2.259999999999827 | 2.26 | -6.26 | 1.74 |
| 2.269999999999827 | 2.27 | -6.27 | 1.73 |
| 2.279999999999827 | 2.28 | -6.28 | 1.72 |
| 2.289999999999826 | 2.29 | -6.29 | 1.71 |
| 2.299999999999826 | 2.3 | -6.3 | 1.7 |
| 2.309999999999826 | 2.31 | -6.31 | 1.69 |
| 2.319999999999826 | 2.32 | -6.32 | 1.68 |
| 2.329999999999825 | 2.33 | -6.33 | 1.67 |
| 2.339999999999825 | 2.34 | -6.34 | 1.66 |
| 2.349999999999825 | 2.35 | -6.35 | 1.65 |
| 2.359999999999825 | 2.36 | -6.36 | 1.64 |
| 2.369999999999825 | 2.37 | -6.37 | 1.63 |
| 2.379999999999824 | 2.38 | -6.38 | 1.62 |
| 2.389999999999824 | 2.39 | -6.39 | 1.61 |
| 2.399999999999824 | 2.4 | -6.4 | 1.6 |
| 2.409999999999824 | 2.41 | -6.41 | 1.59 |
| 2.419999999999824 | 2.42 | -6.42 | 1.58 |
| 2.429999999999823 | 2.43 | -6.43 | 1.57 |
| 2.439999999999823 | 2.44 | -6.44 | 1.56 |
| 2.449999999999823 | 2.45 | -6.45 | 1.55 |
| 2.459999999999823 | 2.46 | -6.46 | 1.54 |
| 2.469999999999823 | 2.47 | -6.47 | 1.53 |
| 2.479999999999822 | 2.48 | -6.48 | 1.52 |
| 2.489999999999822 | 2.49 | -6.49 | 1.51 |
| 2.499999999999822 | 2.5 | -6.5 | 1.5 |
| 2.509999999999822 | 2.51 | -6.51 | 1.49 |
| 2.519999999999821 | 2.52 | -6.52 | 1.48 |
| 2.529999999999821 | 2.53 | -6.53 | 1.47 |
| 2.539999999999821 | 2.54 | -6.54 | 1.46 |
| 2.549999999999821 | 2.55 | -6.55 | 1.45 |
| 2.559999999999821 | 2.56 | -6.56 | 1.44 |
| 2.56999999999982 | 2.57 | -6.57 | 1.43 |
| 2.57999999999982 | 2.58 | -6.58 | 1.42 |
| 2.58999999999982 | 2.59 | -6.59 | 1.41 |
| 2.59999999999982 | 2.6 | -6.6 | 1.4 |
| 2.609999999999819 | 2.61 | -6.61 | 1.39 |
| 2.619999999999819 | 2.62 | -6.62 | 1.38 |
| 2.629999999999819 | 2.63 | -6.63 | 1.37 |
| 2.639999999999819 | 2.64 | -6.64 | 1.36 |
| 2.649999999999819 | 2.65 | -6.65 | 1.35 |
| 2.659999999999818 | 2.66 | -6.66 | 1.34 |
| 2.669999999999818 | 2.67 | -6.67 | 1.33 |
| 2.679999999999818 | 2.68 | -6.68 | 1.32 |
| 2.689999999999818 | 2.69 | -6.69 | 1.31 |
| 2.699999999999818 | 2.7 | -6.7 | 1.3 |
| 2.709999999999817 | 2.71 | -6.71 | 1.29 |
| 2.719999999999817 | 2.72 | -6.72 | 1.28 |
| 2.729999999999817 | 2.73 | -6.73 | 1.27 |
| 2.739999999999817 | 2.74 | -6.74 | 1.26 |
| 2.749999999999817 | 2.75 | -6.75 | 1.25 |
| 2.759999999999816 | 2.76 | -6.76 | 1.24 |
| 2.769999999999816 | 2.77 | -6.77 | 1.23 |
| 2.779999999999816 | 2.78 | -6.78 | 1.22 |
| 2.789999999999816 | 2.79 | -6.79 | 1.21 |
| 2.799999999999815 | 2.8 | -6.8 | 1.2 |
| 2.809999999999815 | 2.81 | -6.81 | 1.19 |
| 2.819999999999815 | 2.82 | -6.82 | 1.18 |
| 2.829999999999815 | 2.83 | -6.83 | 1.17 |
| 2.839999999999815 | 2.84 | -6.84 | 1.16 |
| 2.849999999999814 | 2.85 | -6.85 | 1.15 |
| 2.859999999999814 | 2.86 | -6.86 | 1.14 |
| 2.869999999999814 | 2.87 | -6.87 | 1.13 |
| 2.879999999999814 | 2.88 | -6.88 | 1.12 |
| 2.889999999999814 | 2.89 | -6.89 | 1.11 |
| 2.899999999999813 | 2.9 | -6.9 | 1.1 |
| 2.909999999999813 | 2.91 | -6.91 | 1.09 |
| 2.919999999999813 | 2.92 | -6.92 | 1.08 |
| 2.929999999999813 | 2.93 | -6.93 | 1.07 |
| 2.939999999999813 | 2.94 | -6.94 | 1.06 |
| 2.949999999999812 | 2.95 | -6.95 | 1.05 |
| 2.959999999999812 | 2.96 | -6.96 | 1.04 |
| 2.969999999999812 | 2.97 | -6.97 | 1.03 |
| 2.979999999999812 | 2.98 | -6.98 | 1.02 |
| 2.989999999999811 | 2.99 | -6.99 | 1.01 |
| 2.999999999999811 | 3 | -7 | 1 |
| 3.009999999999811 | 3.01 | -7.01 | 0.99 |
| 3.019999999999811 | 3.02 | -7.02 | 0.98 |
| 3.029999999999811 | 3.03 | -7.03 | 0.97 |
| 3.03999999999981 | 3.04 | -7.04 | 0.96 |
| 3.04999999999981 | 3.05 | -7.05 | 0.95 |
| 3.05999999999981 | 3.06 | -7.06 | 0.94 |
| 3.06999999999981 | 3.07 | -7.07 | 0.93 |
| 3.07999999999981 | 3.08 | -7.08 | 0.92 |
| 3.089999999999809 | 3.09 | -7.09 | 0.91 |
| 3.099999999999809 | 3.1 | -7.1 | 0.9 |
| 3.109999999999809 | 3.11 | -7.11 | 0.89 |
| 3.119999999999809 | 3.12 | -7.12 | 0.88 |
| 3.129999999999808 | 3.13 | -7.13 | 0.87 |
| 3.139999999999808 | 3.14 | -7.14 | 0.86 |
| 3.149999999999808 | 3.15 | -7.15 | 0.85 |
| 3.159999999999808 | 3.16 | -7.16 | 0.84 |
| 3.169999999999808 | 3.17 | -7.17 | 0.83 |
| 3.179999999999807 | 3.18 | -7.18 | 0.82 |
| 3.189999999999807 | 3.19 | -7.19 | 0.81 |
| 3.199999999999807 | 3.2 | -7.2 | 0.8 |
| 3.209999999999807 | 3.21 | -7.21 | 0.79 |
| 3.219999999999807 | 3.22 | -7.22 | 0.78 |
| 3.229999999999806 | 3.23 | -7.23 | 0.77 |
| 3.239999999999806 | 3.24 | -7.24 | 0.76 |
| 3.249999999999806 | 3.25 | -7.25 | 0.75 |
| 3.259999999999806 | 3.26 | -7.26 | 0.74 |
| 3.269999999999805 | 3.27 | -7.27 | 0.73 |
| 3.279999999999805 | 3.28 | -7.28 | 0.72 |
| 3.289999999999805 | 3.29 | -7.29 | 0.71 |
| 3.299999999999805 | 3.3 | -7.3 | 0.7 |
| 3.309999999999805 | 3.31 | -7.31 | 0.69 |
| 3.319999999999804 | 3.32 | -7.32 | 0.68 |
| 3.329999999999804 | 3.33 | -7.33 | 0.67 |
| 3.339999999999804 | 3.34 | -7.34 | 0.66 |
| 3.349999999999804 | 3.35 | -7.35 | 0.65 |
| 3.359999999999804 | 3.36 | -7.36 | 0.64 |
| 3.369999999999803 | 3.37 | -7.37 | 0.63 |
| 3.379999999999803 | 3.38 | -7.38 | 0.62 |
| 3.389999999999803 | 3.39 | -7.39 | 0.61 |
| 3.399999999999803 | 3.4 | -7.4 | 0.6 |
| 3.409999999999802 | 3.41 | -7.41 | 0.59 |
| 3.419999999999802 | 3.42 | -7.42 | 0.58 |
| 3.429999999999802 | 3.43 | -7.43 | 0.57 |
| 3.439999999999802 | 3.44 | -7.44 | 0.56 |
| 3.449999999999802 | 3.45 | -7.45 | 0.55 |
| 3.459999999999801 | 3.46 | -7.46 | 0.54 |
| 3.469999999999801 | 3.47 | -7.47 | 0.53 |
| 3.479999999999801 | 3.48 | -7.48 | 0.52 |
| 3.489999999999801 | 3.49 | -7.49 | 0.51 |
| 3.499999999999801 | 3.5 | -7.5 | 0.5 |
| 3.5099999999998 | 3.51 | -7.51 | 0.49 |
| 3.5199999999998 | 3.52 | -7.52 | 0.48 |
| 3.5299999999998 | 3.53 | -7.53 | 0.47 |
| 3.5399999999998 | 3.54 | -7.54 | 0.46 |
| 3.5499999999998 | 3.55 | -7.55 | 0.45 |
| 3.559999999999799 | 3.56 | -7.56 | 0.44 |
| 3.569999999999799 | 3.57 | -7.57 | 0.43 |
| 3.579999999999799 | 3.58 | -7.58 | 0.42 |
| 3.589999999999799 | 3.59 | -7.59 | 0.41 |
| 3.599999999999798 | 3.6 | -7.6 | 0.4 |
| 3.609999999999798 | 3.61 | -7.61 | 0.39 |
| 3.619999999999798 | 3.62 | -7.62 | 0.38 |
| 3.629999999999798 | 3.63 | -7.63 | 0.37 |
| 3.639999999999798 | 3.64 | -7.64 | 0.36 |
| 3.649999999999797 | 3.65 | -7.65 | 0.35 |
| 3.659999999999797 | 3.66 | -7.66 | 0.34 |
| 3.669999999999797 | 3.67 | -7.67 | 0.33 |
| 3.679999999999797 | 3.68 | -7.68 | 0.32 |
| 3.689999999999796 | 3.69 | -7.69 | 0.31 |
| 3.699999999999796 | 3.7 | -7.7 | 0.3 |
| 3.709999999999796 | 3.71 | -7.71 | 0.29 |
| 3.719999999999796 | 3.72 | -7.72 | 0.28 |
| 3.729999999999796 | 3.73 | -7.73 | 0.27 |
| 3.739999999999795 | 3.74 | -7.74 | 0.26 |
| 3.749999999999795 | 3.75 | -7.75 | 0.25 |
| 3.759999999999795 | 3.76 | -7.76 | 0.24 |
| 3.769999999999795 | 3.77 | -7.77 | 0.23 |
| 3.779999999999795 | 3.78 | -7.78 | 0.22 |
| 3.789999999999794 | 3.79 | -7.79 | 0.21 |
| 3.799999999999794 | 3.8 | -7.8 | 0.2 |
| 3.809999999999794 | 3.81 | -7.81 | 0.19 |
| 3.819999999999794 | 3.82 | -7.82 | 0.18 |
| 3.829999999999794 | 3.83 | -7.83 | 0.17 |
| 3.839999999999793 | 3.84 | -7.84 | 0.16 |
| 3.849999999999793 | 3.85 | -7.85 | 0.15 |
| 3.859999999999793 | 3.86 | -7.86 | 0.14 |
| 3.869999999999793 | 3.87 | -7.87 | 0.13 |
| 3.879999999999792 | 3.88 | -7.88 | 0.12 |
| 3.889999999999792 | 3.89 | -7.89 | 0.11 |
| 3.899999999999792 | 3.9 | -7.9 | 0.1 |
| 3.909999999999792 | 3.91 | -7.91 | 0.09 |
| 3.919999999999792 | 3.92 | -7.92 | 0.08 |
| 3.929999999999791 | 3.93 | -7.93 | 0.07 |
| 3.939999999999791 | 3.94 | -7.94 | 0.06 |
| 3.949999999999791 | 3.95 | -7.95 | 0.05 |
| 3.959999999999791 | 3.96 | -7.96 | 0.04 |
| 3.969999999999791 | 3.97 | -7.97 | 0.03 |
| 3.97999999999979 | 3.98 | -7.98 | 0.02 |
| 3.98999999999979 | 3.99 | -7.99 | 0.01 |
| 3.99999999999979 | 4 | -8 | 0 |
| 4.00999999999979 | 4.01 | -8.01 | -0.01 |
| 4.01999999999979 | 4.02 | -8.02 | -0.02 |
| 4.02999999999979 | 4.03 | -8.03 | -0.03 |
| 4.03999999999979 | 4.04 | -8.04 | -0.04 |
| 4.04999999999979 | 4.05 | -8.05 | -0.05 |
| 4.05999999999979 | 4.06 | -8.06 | -0.06 |
| 4.069999999999789 | 4.07 | -8.07 | -0.07 |
| 4.079999999999788 | 4.08 | -8.08 | -0.08 |
| 4.089999999999788 | 4.09 | -8.09 | -0.09 |
| 4.099999999999788 | 4.1 | -8.1 | -0.1 |
| 4.109999999999788 | 4.11 | -8.11 | -0.11 |
| 4.119999999999788 | 4.12 | -8.12 | -0.12 |
| 4.129999999999788 | 4.13 | -8.13 | -0.13 |
| 4.139999999999787 | 4.14 | -8.14 | -0.14 |
| 4.149999999999787 | 4.15 | -8.15 | -0.15 |
| 4.159999999999787 | 4.16 | -8.16 | -0.16 |
| 4.169999999999787 | 4.17 | -8.17 | -0.17 |
| 4.179999999999786 | 4.18 | -8.18 | -0.18 |
| 4.189999999999786 | 4.19 | -8.19 | -0.19 |
| 4.199999999999786 | 4.2 | -8.2 | -0.2 |
| 4.209999999999785 | 4.21 | -8.21 | -0.21 |
| 4.219999999999785 | 4.22 | -8.22 | -0.22 |
| 4.229999999999785 | 4.23 | -8.23 | -0.23 |
| 4.239999999999785 | 4.24 | -8.24 | -0.24 |
| 4.249999999999785 | 4.25 | -8.25 | -0.25 |
| 4.259999999999784 | 4.26 | -8.26 | -0.26 |
| 4.269999999999784 | 4.27 | -8.27 | -0.27 |
| 4.279999999999784 | 4.28 | -8.28 | -0.28 |
| 4.289999999999784 | 4.29 | -8.29 | -0.29 |
| 4.299999999999784 | 4.3 | -8.3 | -0.3 |
| 4.309999999999784 | 4.31 | -8.31 | -0.31 |
| 4.319999999999784 | 4.32 | -8.32 | -0.32 |
| 4.329999999999783 | 4.33 | -8.33 | -0.33 |
| 4.339999999999783 | 4.34 | -8.34 | -0.34 |
| 4.349999999999783 | 4.35 | -8.35 | -0.35 |
| 4.359999999999783 | 4.36 | -8.36 | -0.36 |
| 4.369999999999782 | 4.37 | -8.37 | -0.37 |
| 4.379999999999782 | 4.38 | -8.38 | -0.38 |
| 4.389999999999782 | 4.39 | -8.39 | -0.39 |
| 4.399999999999782 | 4.4 | -8.4 | -0.4 |
| 4.409999999999781 | 4.41 | -8.41 | -0.41 |
| 4.419999999999781 | 4.42 | -8.42 | -0.42 |
| 4.429999999999781 | 4.43 | -8.43 | -0.43 |
| 4.43999999999978 | 4.44 | -8.44 | -0.44 |
| 4.44999999999978 | 4.45 | -8.45 | -0.45 |
| 4.45999999999978 | 4.46 | -8.46 | -0.46 |
| 4.46999999999978 | 4.47 | -8.47 | -0.47 |
| 4.47999999999978 | 4.48 | -8.48 | -0.48 |
| 4.48999999999978 | 4.49 | -8.49 | -0.49 |
| 4.49999999999978 | 4.5 | -8.5 | -0.5 |
| 4.50999999999978 | 4.51 | -8.51 | -0.51 |
| 4.51999999999978 | 4.52 | -8.52 | -0.52 |
| 4.52999999999978 | 4.53 | -8.53 | -0.53 |
| 4.539999999999778 | 4.54 | -8.54 | -0.54 |
| 4.549999999999778 | 4.55 | -8.55 | -0.55 |
| 4.559999999999778 | 4.56 | -8.56 | -0.56 |
| 4.569999999999778 | 4.57 | -8.57 | -0.57 |
| 4.579999999999778 | 4.58 | -8.58 | -0.58 |
| 4.589999999999777 | 4.59 | -8.59 | -0.59 |
| 4.599999999999777 | 4.6 | -8.6 | -0.6 |
| 4.609999999999777 | 4.61 | -8.61 | -0.61 |
| 4.619999999999777 | 4.62 | -8.62 | -0.62 |
| 4.629999999999777 | 4.63 | -8.63 | -0.63 |
| 4.639999999999776 | 4.64 | -8.64 | -0.64 |
| 4.649999999999776 | 4.65 | -8.65 | -0.65 |
| 4.659999999999776 | 4.66 | -8.66 | -0.66 |
| 4.669999999999776 | 4.67 | -8.67 | -0.67 |
| 4.679999999999775 | 4.68 | -8.68 | -0.68 |
| 4.689999999999775 | 4.69 | -8.69 | -0.69 |
| 4.699999999999775 | 4.7 | -8.7 | -0.7 |
| 4.709999999999775 | 4.71 | -8.71 | -0.71 |
| 4.719999999999774 | 4.72 | -8.72 | -0.72 |
| 4.729999999999774 | 4.73 | -8.73 | -0.73 |
| 4.739999999999774 | 4.74 | -8.74 | -0.74 |
| 4.749999999999774 | 4.75 | -8.75 | -0.75 |
| 4.759999999999774 | 4.76 | -8.76 | -0.76 |
| 4.769999999999774 | 4.77 | -8.77 | -0.77 |
| 4.779999999999773 | 4.78 | -8.78 | -0.78 |
| 4.789999999999773 | 4.79 | -8.79 | -0.79 |
| 4.799999999999773 | 4.8 | -8.8 | -0.8 |
| 4.809999999999773 | 4.81 | -8.81 | -0.81 |
| 4.819999999999773 | 4.82 | -8.82 | -0.82 |
| 4.829999999999773 | 4.83 | -8.83 | -0.83 |
| 4.839999999999772 | 4.84 | -8.84 | -0.84 |
| 4.849999999999772 | 4.85 | -8.85 | -0.85 |
| 4.859999999999772 | 4.86 | -8.86 | -0.86 |
| 4.869999999999772 | 4.87 | -8.87 | -0.87 |
| 4.879999999999771 | 4.88 | -8.88 | -0.88 |
| 4.889999999999771 | 4.89 | -8.89 | -0.89 |
| 4.899999999999771 | 4.9 | -8.9 | -0.9 |
| 4.90999999999977 | 4.91 | -8.91 | -0.91 |
| 4.91999999999977 | 4.92 | -8.92 | -0.92 |
| 4.92999999999977 | 4.93 | -8.93 | -0.93 |
| 4.93999999999977 | 4.94 | -8.94 | -0.94 |
| 4.94999999999977 | 4.95 | -8.95 | -0.95 |
| 4.95999999999977 | 4.96 | -8.96 | -0.96 |
| 4.96999999999977 | 4.97 | -8.97 | -0.97 |
| 4.97999999999977 | 4.98 | -8.98 | -0.98 |
| 4.98999999999977 | 4.99 | -8.99 | -0.99 |
| 4.99999999999977 | 5 | -9 | -1 |
| 5.009999999999768 | 5.01 | -9.01 | -1.01 |
| 5.019999999999768 | 5.02 | -9.02 | -1.02 |
| 5.029999999999768 | 5.03 | -9.03 | -1.03 |
| 5.039999999999768 | 5.04 | -9.04 | -1.04 |
| 5.049999999999767 | 5.05 | -9.05 | -1.05 |
| 5.059999999999767 | 5.06 | -9.06 | -1.06 |
| 5.069999999999767 | 5.07 | -9.07 | -1.07 |
| 5.079999999999767 | 5.08 | -9.08 | -1.08 |
| 5.089999999999767 | 5.09 | -9.09 | -1.09 |
| 5.099999999999766 | 5.1 | -9.1 | -1.1 |
| 5.109999999999766 | 5.11 | -9.11 | -1.11 |
| 5.119999999999766 | 5.12 | -9.12 | -1.12 |
| 5.129999999999766 | 5.13 | -9.13 | -1.13 |
| 5.139999999999766 | 5.14 | -9.14 | -1.14 |
| 5.149999999999765 | 5.15 | -9.15 | -1.15 |
| 5.159999999999765 | 5.16 | -9.16 | -1.16 |
| 5.169999999999765 | 5.17 | -9.17 | -1.17 |
| 5.179999999999765 | 5.18 | -9.18 | -1.18 |
| 5.189999999999764 | 5.19 | -9.19 | -1.19 |
| 5.199999999999764 | 5.2 | -9.2 | -1.2 |
| 5.209999999999764 | 5.21 | -9.21 | -1.21 |
| 5.219999999999764 | 5.22 | -9.22 | -1.22 |
| 5.229999999999764 | 5.23 | -9.23 | -1.23 |
| 5.239999999999763 | 5.24 | -9.24 | -1.24 |
| 5.249999999999763 | 5.25 | -9.25 | -1.25 |
| 5.259999999999763 | 5.26 | -9.26 | -1.26 |
| 5.269999999999763 | 5.27 | -9.27 | -1.27 |
| 5.279999999999763 | 5.28 | -9.28 | -1.28 |
| 5.289999999999762 | 5.29 | -9.29 | -1.29 |
| 5.299999999999762 | 5.3 | -9.3 | -1.3 |
| 5.309999999999762 | 5.31 | -9.31 | -1.31 |
| 5.319999999999762 | 5.32 | -9.32 | -1.32 |
| 5.329999999999762 | 5.33 | -9.33 | -1.33 |
| 5.339999999999761 | 5.34 | -9.34 | -1.34 |
| 5.349999999999761 | 5.35 | -9.35 | -1.35 |
| 5.359999999999761 | 5.36 | -9.36 | -1.36 |
| 5.369999999999761 | 5.37 | -9.37 | -1.37 |
| 5.37999999999976 | 5.38 | -9.38 | -1.38 |
| 5.38999999999976 | 5.39 | -9.39 | -1.39 |
| 5.39999999999976 | 5.4 | -9.4 | -1.4 |
| 5.40999999999976 | 5.41 | -9.41 | -1.41 |
| 5.41999999999976 | 5.42 | -9.42 | -1.42 |
| 5.42999999999976 | 5.43 | -9.43 | -1.43 |
| 5.43999999999976 | 5.44 | -9.44 | -1.44 |
| 5.44999999999976 | 5.45 | -9.45 | -1.45 |
| 5.45999999999976 | 5.46 | -9.46 | -1.46 |
| 5.46999999999976 | 5.47 | -9.47 | -1.47 |
| 5.479999999999758 | 5.48 | -9.48 | -1.48 |
| 5.489999999999758 | 5.49 | -9.49 | -1.49 |
| 5.499999999999758 | 5.5 | -9.5 | -1.5 |
| 5.509999999999758 | 5.51 | -9.51 | -1.51 |
| 5.519999999999758 | 5.52 | -9.52 | -1.52 |
| 5.529999999999758 | 5.53 | -9.53 | -1.53 |
| 5.539999999999757 | 5.54 | -9.54 | -1.54 |
| 5.549999999999757 | 5.55 | -9.55 | -1.55 |
| 5.559999999999757 | 5.56 | -9.56 | -1.56 |
| 5.569999999999757 | 5.57 | -9.57 | -1.57 |
| 5.579999999999756 | 5.58 | -9.58 | -1.58 |
| 5.589999999999756 | 5.59 | -9.59 | -1.59 |
| 5.599999999999756 | 5.6 | -9.6 | -1.6 |
| 5.609999999999756 | 5.61 | -9.61 | -1.61 |
| 5.619999999999756 | 5.62 | -9.62 | -1.62 |
| 5.629999999999756 | 5.63 | -9.63 | -1.63 |
| 5.639999999999755 | 5.64 | -9.64 | -1.64 |
| 5.649999999999755 | 5.65 | -9.65 | -1.65 |
| 5.659999999999755 | 5.66 | -9.66 | -1.66 |
| 5.669999999999755 | 5.67 | -9.67 | -1.67 |
| 5.679999999999754 | 5.68 | -9.68 | -1.68 |
| 5.689999999999754 | 5.69 | -9.69 | -1.69 |
| 5.699999999999754 | 5.7 | -9.7 | -1.7 |
| 5.709999999999754 | 5.71 | -9.71 | -1.71 |
| 5.719999999999754 | 5.72 | -9.72 | -1.72 |
| 5.729999999999753 | 5.73 | -9.73 | -1.73 |
| 5.739999999999753 | 5.74 | -9.74 | -1.74 |
| 5.749999999999753 | 5.75 | -9.75 | -1.75 |
| 5.759999999999753 | 5.76 | -9.76 | -1.76 |
| 5.769999999999753 | 5.77 | -9.77 | -1.77 |
| 5.779999999999752 | 5.78 | -9.78 | -1.78 |
| 5.789999999999752 | 5.79 | -9.79 | -1.79 |
| 5.799999999999752 | 5.8 | -9.8 | -1.8 |
| 5.809999999999752 | 5.81 | -9.81 | -1.81 |
| 5.819999999999752 | 5.82 | -9.82 | -1.82 |
| 5.829999999999751 | 5.83 | -9.83 | -1.83 |
| 5.839999999999751 | 5.84 | -9.84 | -1.84 |
| 5.849999999999751 | 5.85 | -9.85 | -1.85 |
| 5.859999999999751 | 5.86 | -9.86 | -1.86 |
| 5.86999999999975 | 5.87 | -9.87 | -1.87 |
| 5.87999999999975 | 5.88 | -9.88 | -1.88 |
| 5.88999999999975 | 5.89 | -9.89 | -1.89 |
| 5.89999999999975 | 5.9 | -9.9 | -1.9 |
| 5.90999999999975 | 5.91 | -9.91 | -1.91 |
| 5.91999999999975 | 5.92 | -9.92 | -1.92 |
| 5.92999999999975 | 5.93 | -9.93 | -1.93 |
| 5.93999999999975 | 5.94 | -9.94 | -1.94 |
| 5.949999999999748 | 5.95 | -9.95 | -1.95 |
| 5.959999999999748 | 5.96 | -9.96 | -1.96 |
| 5.969999999999748 | 5.97 | -9.97 | -1.97 |
| 5.979999999999748 | 5.98 | -9.98 | -1.98 |
| 5.989999999999747 | 5.99 | -9.99 | -1.99 |
| 5.999999999999747 | 6 | -10 | -2 |
| 6.009999999999747 | 6.01 | -10.01 | -2.01 |
| 6.019999999999747 | 6.02 | -10.02 | -2.02 |
| 6.029999999999747 | 6.03 | -10.03 | -2.03 |
| 6.039999999999746 | 6.04 | -10.04 | -2.04 |
| 6.049999999999746 | 6.05 | -10.05 | -2.05 |
| 6.059999999999746 | 6.06 | -10.06 | -2.06 |
| 6.069999999999746 | 6.07 | -10.07 | -2.07 |
| 6.079999999999746 | 6.08 | -10.08 | -2.08 |
| 6.089999999999745 | 6.09 | -10.09 | -2.09 |
| 6.099999999999745 | 6.1 | -10.1 | -2.1 |
| 6.109999999999745 | 6.11 | -10.11 | -2.11 |
| 6.119999999999745 | 6.12 | -10.12 | -2.12 |
| 6.129999999999745 | 6.13 | -10.13 | -2.13 |
| 6.139999999999744 | 6.14 | -10.14 | -2.14 |
| 6.149999999999744 | 6.15 | -10.15 | -2.15 |
| 6.159999999999744 | 6.16 | -10.16 | -2.16 |
| 6.169999999999744 | 6.17 | -10.17 | -2.17 |
| 6.179999999999744 | 6.18 | -10.18 | -2.18 |
| 6.189999999999744 | 6.19 | -10.19 | -2.19 |
| 6.199999999999743 | 6.2 | -10.2 | -2.2 |
| 6.209999999999743 | 6.21 | -10.21 | -2.21 |
| 6.219999999999743 | 6.22 | -10.22 | -2.22 |
| 6.229999999999743 | 6.23 | -10.23 | -2.23 |
| 6.239999999999742 | 6.24 | -10.24 | -2.24 |
| 6.249999999999742 | 6.25 | -10.25 | -2.25 |
| 6.259999999999742 | 6.26 | -10.26 | -2.26 |
| 6.269999999999742 | 6.27 | -10.27 | -2.27 |
| 6.279999999999741 | 6.28 | -10.28 | -2.28 |
| 6.289999999999741 | 6.29 | -10.29 | -2.29 |
| 6.299999999999741 | 6.3 | -10.3 | -2.3 |
| 6.309999999999741 | 6.31 | -10.31 | -2.31 |
| 6.319999999999741 | 6.32 | -10.32 | -2.32 |
| 6.329999999999741 | 6.33 | -10.33 | -2.33 |
| 6.33999999999974 | 6.34 | -10.34 | -2.34 |
| 6.34999999999974 | 6.35 | -10.35 | -2.35 |
| 6.35999999999974 | 6.36 | -10.36 | -2.36 |
| 6.36999999999974 | 6.37 | -10.37 | -2.37 |
| 6.37999999999974 | 6.38 | -10.38 | -2.38 |
| 6.38999999999974 | 6.39 | -10.39 | -2.39 |
| 6.39999999999974 | 6.4 | -10.4 | -2.4 |
| 6.409999999999738 | 6.41 | -10.41 | -2.41 |
| 6.419999999999738 | 6.42 | -10.42 | -2.42 |
| 6.429999999999738 | 6.43 | -10.43 | -2.43 |
| 6.439999999999738 | 6.44 | -10.44 | -2.44 |
| 6.449999999999738 | 6.45 | -10.45 | -2.45 |
| 6.459999999999737 | 6.46 | -10.46 | -2.46 |
| 6.469999999999737 | 6.47 | -10.47 | -2.47 |
| 6.479999999999737 | 6.48 | -10.48 | -2.48 |
| 6.489999999999737 | 6.49 | -10.49 | -2.49 |
| 6.499999999999737 | 6.5 | -10.5 | -2.5 |
| 6.509999999999736 | 6.51 | -10.51 | -2.51 |
| 6.519999999999736 | 6.52 | -10.52 | -2.52 |
| 6.529999999999736 | 6.53 | -10.53 | -2.53 |
| 6.539999999999736 | 6.54 | -10.54 | -2.54 |
| 6.549999999999736 | 6.55 | -10.55 | -2.55 |
| 6.559999999999735 | 6.56 | -10.56 | -2.56 |
| 6.569999999999735 | 6.57 | -10.57 | -2.57 |
| 6.579999999999735 | 6.58 | -10.58 | -2.58 |
| 6.589999999999735 | 6.59 | -10.59 | -2.59 |
| 6.599999999999734 | 6.6 | -10.6 | -2.6 |
| 6.609999999999734 | 6.61 | -10.61 | -2.61 |
| 6.619999999999734 | 6.62 | -10.62 | -2.62 |
| 6.629999999999734 | 6.63 | -10.63 | -2.63 |
| 6.639999999999734 | 6.64 | -10.64 | -2.64 |
| 6.649999999999734 | 6.65 | -10.65 | -2.65 |
| 6.659999999999734 | 6.66 | -10.66 | -2.66 |
| 6.669999999999733 | 6.67 | -10.67 | -2.67 |
| 6.679999999999733 | 6.68 | -10.68 | -2.68 |
| 6.689999999999733 | 6.69 | -10.69 | -2.69 |
| 6.699999999999733 | 6.7 | -10.7 | -2.7 |
| 6.709999999999732 | 6.71 | -10.71 | -2.71 |
| 6.719999999999732 | 6.72 | -10.72 | -2.72 |
| 6.729999999999732 | 6.73 | -10.73 | -2.73 |
| 6.739999999999731 | 6.74 | -10.74 | -2.74 |
| 6.749999999999731 | 6.75 | -10.75 | -2.75 |
| 6.759999999999731 | 6.76 | -10.76 | -2.76 |
| 6.769999999999731 | 6.77 | -10.77 | -2.77 |
| 6.77999999999973 | 6.78 | -10.78 | -2.78 |
| 6.78999999999973 | 6.79 | -10.79 | -2.79 |
| 6.79999999999973 | 6.8 | -10.8 | -2.8 |
| 6.80999999999973 | 6.81 | -10.81 | -2.81 |
| 6.81999999999973 | 6.82 | -10.82 | -2.82 |
| 6.82999999999973 | 6.83 | -10.83 | -2.83 |
| 6.83999999999973 | 6.84 | -10.84 | -2.84 |
| 6.84999999999973 | 6.85 | -10.85 | -2.85 |
| 6.85999999999973 | 6.86 | -10.86 | -2.86 |
| 6.86999999999973 | 6.87 | -10.87 | -2.87 |
| 6.879999999999728 | 6.88 | -10.88 | -2.88 |
| 6.889999999999728 | 6.89 | -10.89 | -2.89 |
| 6.899999999999728 | 6.9 | -10.9 | -2.9 |
| 6.909999999999728 | 6.91 | -10.91 | -2.91 |
| 6.919999999999728 | 6.92 | -10.92 | -2.92 |
| 6.929999999999727 | 6.93 | -10.93 | -2.93 |
| 6.939999999999727 | 6.94 | -10.94 | -2.94 |
| 6.949999999999727 | 6.95 | -10.95 | -2.95 |
| 6.959999999999727 | 6.96 | -10.96 | -2.96 |
| 6.969999999999727 | 6.97 | -10.97 | -2.97 |
| 6.979999999999726 | 6.98 | -10.98 | -2.98 |
| 6.989999999999726 | 6.99 | -10.99 | -2.99 |
| 6.999999999999726 | 7 | -11 | -3 |
| 7.009999999999726 | 7.01 | -11.01 | -3.01 |
| 7.019999999999726 | 7.02 | -11.02 | -3.02 |
| 7.029999999999725 | 7.03 | -11.03 | -3.03 |
| 7.039999999999725 | 7.04 | -11.04 | -3.04 |
| 7.049999999999725 | 7.05 | -11.05 | -3.05 |
| 7.059999999999725 | 7.06 | -11.06 | -3.06 |
| 7.069999999999724 | 7.07 | -11.07 | -3.07 |
| 7.079999999999724 | 7.08 | -11.08 | -3.08 |
| 7.089999999999724 | 7.09 | -11.09 | -3.09 |
| 7.099999999999724 | 7.1 | -11.1 | -3.1 |
| 7.109999999999724 | 7.11 | -11.11 | -3.11 |
| 7.119999999999724 | 7.12 | -11.12 | -3.12 |
| 7.129999999999724 | 7.13 | -11.13 | -3.13 |
| 7.139999999999723 | 7.14 | -11.14 | -3.14 |
| 7.149999999999723 | 7.15 | -11.15 | -3.15 |
| 7.159999999999723 | 7.16 | -11.16 | -3.16 |
| 7.169999999999723 | 7.17 | -11.17 | -3.17 |
| 7.179999999999722 | 7.18 | -11.18 | -3.18 |
| 7.189999999999722 | 7.19 | -11.19 | -3.19 |
| 7.199999999999722 | 7.2 | -11.2 | -3.2 |
| 7.209999999999721 | 7.21 | -11.21 | -3.21 |
| 7.219999999999721 | 7.22 | -11.22 | -3.22 |
| 7.229999999999721 | 7.23 | -11.23 | -3.23 |
| 7.23999999999972 | 7.24 | -11.24 | -3.24 |
| 7.24999999999972 | 7.25 | -11.25 | -3.25 |
| 7.25999999999972 | 7.26 | -11.26 | -3.26 |
| 7.26999999999972 | 7.27 | -11.27 | -3.27 |
| 7.27999999999972 | 7.28 | -11.28 | -3.28 |
| 7.28999999999972 | 7.29 | -11.29 | -3.29 |
| 7.29999999999972 | 7.3 | -11.3 | -3.3 |
| 7.30999999999972 | 7.31 | -11.31 | -3.31 |
| 7.31999999999972 | 7.32 | -11.32 | -3.32 |
| 7.329999999999719 | 7.33 | -11.33 | -3.33 |
| 7.33999999999972 | 7.34 | -11.34 | -3.34 |
| 7.349999999999719 | 7.35 | -11.35 | -3.35 |
| 7.359999999999719 | 7.36 | -11.36 | -3.36 |
| 7.369999999999718 | 7.37 | -11.37 | -3.37 |
| 7.379999999999718 | 7.38 | -11.38 | -3.38 |
| 7.389999999999718 | 7.39 | -11.39 | -3.39 |
| 7.399999999999718 | 7.4 | -11.4 | -3.4 |
| 7.409999999999717 | 7.41 | -11.41 | -3.41 |
| 7.419999999999717 | 7.42 | -11.42 | -3.42 |
| 7.429999999999717 | 7.43 | -11.43 | -3.43 |
| 7.439999999999717 | 7.44 | -11.44 | -3.44 |
| 7.449999999999716 | 7.45 | -11.45 | -3.45 |
| 7.459999999999716 | 7.46 | -11.46 | -3.46 |
| 7.469999999999716 | 7.47 | -11.47 | -3.47 |
| 7.479999999999716 | 7.48 | -11.48 | -3.48 |
| 7.489999999999715 | 7.49 | -11.49 | -3.49 |
| 7.499999999999715 | 7.5 | -11.5 | -3.5 |
| 7.509999999999715 | 7.51 | -11.51 | -3.51 |
| 7.519999999999715 | 7.52 | -11.52 | -3.52 |
| 7.529999999999715 | 7.53 | -11.53 | -3.53 |
| 7.539999999999714 | 7.54 | -11.54 | -3.54 |
| 7.549999999999714 | 7.55 | -11.55 | -3.55 |
| 7.559999999999714 | 7.56 | -11.56 | -3.56 |
| 7.569999999999714 | 7.57 | -11.57 | -3.57 |
| 7.579999999999714 | 7.58 | -11.58 | -3.58 |
| 7.589999999999714 | 7.59 | -11.59 | -3.59 |
| 7.599999999999714 | 7.6 | -11.6 | -3.6 |
| 7.609999999999713 | 7.61 | -11.61 | -3.61 |
| 7.619999999999713 | 7.62 | -11.62 | -3.62 |
| 7.629999999999713 | 7.63 | -11.63 | -3.63 |
| 7.639999999999713 | 7.64 | -11.64 | -3.64 |
| 7.649999999999712 | 7.65 | -11.65 | -3.65 |
| 7.659999999999712 | 7.66 | -11.66 | -3.66 |
| 7.669999999999712 | 7.67 | -11.67 | -3.67 |
| 7.679999999999712 | 7.68 | -11.68 | -3.68 |
| 7.689999999999712 | 7.69 | -11.69 | -3.69 |
| 7.699999999999711 | 7.7 | -11.7 | -3.7 |
| 7.709999999999711 | 7.71 | -11.71 | -3.71 |
| 7.719999999999711 | 7.72 | -11.72 | -3.72 |
| 7.729999999999711 | 7.73 | -11.73 | -3.73 |
| 7.73999999999971 | 7.74 | -11.74 | -3.74 |
| 7.74999999999971 | 7.75 | -11.75 | -3.75 |
| 7.75999999999971 | 7.76 | -11.76 | -3.76 |
| 7.76999999999971 | 7.77 | -11.77 | -3.77 |
| 7.77999999999971 | 7.78 | -11.78 | -3.78 |
| 7.78999999999971 | 7.79 | -11.79 | -3.79 |
| 7.79999999999971 | 7.8 | -11.8 | -3.8 |
| 7.80999999999971 | 7.81 | -11.81 | -3.81 |
| 7.819999999999709 | 7.82 | -11.82 | -3.82 |
| 7.829999999999709 | 7.83 | -11.83 | -3.83 |
| 7.839999999999708 | 7.84 | -11.84 | -3.84 |
| 7.849999999999708 | 7.85 | -11.85 | -3.85 |
| 7.859999999999708 | 7.86 | -11.86 | -3.86 |
| 7.869999999999708 | 7.87 | -11.87 | -3.87 |
| 7.879999999999707 | 7.88 | -11.88 | -3.88 |
| 7.889999999999707 | 7.89 | -11.89 | -3.89 |
| 7.899999999999707 | 7.9 | -11.9 | -3.9 |
| 7.909999999999707 | 7.91 | -11.91 | -3.91 |
| 7.919999999999706 | 7.92 | -11.92 | -3.92 |
| 7.929999999999706 | 7.93 | -11.93 | -3.93 |
| 7.939999999999706 | 7.94 | -11.94 | -3.94 |
| 7.949999999999706 | 7.95 | -11.95 | -3.95 |
| 7.959999999999705 | 7.96 | -11.96 | -3.96 |
| 7.969999999999705 | 7.97 | -11.97 | -3.97 |
| 7.979999999999705 | 7.98 | -11.98 | -3.98 |
| 7.989999999999705 | 7.99 | -11.99 | -3.99 |
| 7.999999999999705 | 8 | -12 | -4 |
| 8.009999999999703 | 8.01 | -12.01 | -4.01 |
| 8.019999999999705 | 8.02 | -12.02 | -4.02 |
| 8.029999999999704 | 8.03 | -12.03 | -4.03 |
| 8.039999999999704 | 8.04 | -12.04 | -4.04 |
| 8.049999999999704 | 8.05 | -12.05 | -4.05 |
| 8.059999999999704 | 8.06 | -12.06 | -4.06 |
| 8.069999999999704 | 8.07 | -12.07 | -4.07 |
| 8.079999999999703 | 8.08 | -12.08 | -4.08 |
| 8.089999999999703 | 8.09 | -12.09 | -4.09 |
| 8.099999999999701 | 8.1 | -12.1 | -4.1 |
| 8.109999999999703 | 8.11 | -12.11 | -4.11 |
| 8.119999999999703 | 8.12 | -12.12 | -4.12 |
| 8.129999999999702 | 8.13 | -12.13 | -4.13 |
| 8.139999999999702 | 8.14 | -12.14 | -4.14 |
| 8.1499999999997 | 8.15 | -12.15 | -4.15 |
| 8.1599999999997 | 8.16 | -12.16 | -4.16 |
| 8.1699999999997 | 8.17 | -12.17 | -4.17 |
| 8.1799999999997 | 8.18 | -12.18 | -4.18 |
| 8.1899999999997 | 8.19 | -12.19 | -4.19 |
| 8.1999999999997 | 8.2 | -12.2 | -4.2 |
| 8.2099999999997 | 8.21 | -12.21 | -4.21 |
| 8.2199999999997 | 8.22 | -12.22 | -4.22 |
| 8.2299999999997 | 8.23 | -12.23 | -4.23 |
| 8.2399999999997 | 8.24 | -12.24 | -4.24 |
| 8.2499999999997 | 8.25 | -12.25 | -4.25 |
| 8.2599999999997 | 8.26 | -12.26 | -4.26 |
| 8.2699999999997 | 8.27 | -12.27 | -4.27 |
| 8.2799999999997 | 8.28 | -12.28 | -4.28 |
| 8.289999999999697 | 8.29 | -12.29 | -4.29 |
| 8.299999999999699 | 8.3 | -12.3 | -4.3 |
| 8.309999999999699 | 8.31 | -12.31 | -4.31 |
| 8.319999999999698 | 8.32 | -12.32 | -4.32 |
| 8.329999999999698 | 8.33 | -12.33 | -4.33 |
| 8.339999999999698 | 8.34 | -12.34 | -4.34 |
| 8.349999999999698 | 8.35 | -12.35 | -4.35 |
| 8.359999999999697 | 8.36 | -12.36 | -4.36 |
| 8.369999999999697 | 8.37 | -12.37 | -4.37 |
| 8.379999999999695 | 8.38 | -12.38 | -4.38 |
| 8.389999999999697 | 8.39 | -12.39 | -4.39 |
| 8.399999999999697 | 8.4 | -12.4 | -4.4 |
| 8.409999999999696 | 8.41 | -12.41 | -4.41 |
| 8.419999999999696 | 8.42 | -12.42 | -4.42 |
| 8.429999999999694 | 8.43 | -12.43 | -4.43 |
| 8.439999999999696 | 8.44 | -12.44 | -4.44 |
| 8.449999999999696 | 8.45 | -12.45 | -4.45 |
| 8.459999999999695 | 8.46 | -12.46 | -4.46 |
| 8.469999999999695 | 8.47 | -12.47 | -4.47 |
| 8.479999999999693 | 8.48 | -12.48 | -4.48 |
| 8.489999999999695 | 8.49 | -12.49 | -4.49 |
| 8.499999999999694 | 8.5 | -12.5 | -4.5 |
| 8.509999999999694 | 8.51 | -12.51 | -4.51 |
| 8.519999999999694 | 8.52 | -12.52 | -4.52 |
| 8.529999999999694 | 8.53 | -12.53 | -4.53 |
| 8.539999999999694 | 8.54 | -12.54 | -4.54 |
| 8.549999999999693 | 8.55 | -12.55 | -4.55 |
| 8.55999999999969 | 8.56 | -12.56 | -4.56 |
| 8.56999999999969 | 8.57 | -12.57 | -4.57 |
| 8.57999999999969 | 8.58 | -12.58 | -4.58 |
| 8.58999999999969 | 8.59 | -12.59 | -4.59 |
| 8.59999999999969 | 8.6 | -12.6 | -4.6 |
| 8.60999999999969 | 8.61 | -12.61 | -4.61 |
| 8.61999999999969 | 8.62 | -12.62 | -4.62 |
| 8.62999999999969 | 8.63 | -12.63 | -4.63 |
| 8.63999999999969 | 8.64 | -12.64 | -4.64 |
| 8.64999999999969 | 8.65 | -12.65 | -4.65 |
| 8.65999999999969 | 8.66 | -12.66 | -4.66 |
| 8.66999999999969 | 8.67 | -12.67 | -4.67 |
| 8.67999999999969 | 8.68 | -12.68 | -4.68 |
| 8.68999999999969 | 8.69 | -12.69 | -4.69 |
| 8.69999999999969 | 8.7 | -12.7 | -4.7 |
| 8.70999999999969 | 8.71 | -12.71 | -4.71 |
| 8.71999999999969 | 8.72 | -12.72 | -4.72 |
| 8.72999999999969 | 8.73 | -12.73 | -4.73 |
| 8.73999999999969 | 8.74 | -12.74 | -4.74 |
| 8.74999999999969 | 8.75 | -12.75 | -4.75 |
| 8.759999999999687 | 8.76 | -12.76 | -4.76 |
| 8.769999999999689 | 8.77 | -12.77 | -4.77 |
| 8.779999999999688 | 8.78 | -12.78 | -4.78 |
| 8.789999999999688 | 8.79 | -12.79 | -4.79 |
| 8.799999999999686 | 8.8 | -12.8 | -4.8 |
| 8.809999999999688 | 8.81 | -12.81 | -4.81 |
| 8.819999999999688 | 8.82 | -12.82 | -4.82 |
| 8.829999999999687 | 8.83 | -12.83 | -4.83 |
| 8.839999999999687 | 8.84 | -12.84 | -4.84 |
| 8.849999999999685 | 8.85 | -12.85 | -4.85 |
| 8.859999999999687 | 8.86 | -12.86 | -4.86 |
| 8.869999999999687 | 8.87 | -12.87 | -4.87 |
| 8.879999999999686 | 8.88 | -12.88 | -4.88 |
| 8.889999999999686 | 8.89 | -12.89 | -4.89 |
| 8.899999999999684 | 8.9 | -12.9 | -4.9 |
| 8.909999999999686 | 8.91 | -12.91 | -4.91 |
| 8.919999999999686 | 8.92 | -12.92 | -4.92 |
| 8.929999999999685 | 8.93 | -12.93 | -4.93 |
| 8.939999999999685 | 8.94 | -12.94 | -4.94 |
| 8.949999999999685 | 8.95 | -12.95 | -4.95 |
| 8.959999999999685 | 8.96 | -12.96 | -4.96 |
| 8.969999999999684 | 8.97 | -12.97 | -4.97 |
| 8.979999999999684 | 8.98 | -12.98 | -4.98 |
| 8.989999999999682 | 8.99 | -12.99 | -4.99 |
| 8.999999999999684 | 9 | -13 | -5 |
| 9.009999999999684 | 9.01 | -13.01 | -5.01 |
| 9.019999999999683 | 9.02 | -13.02 | -5.02 |
| 9.029999999999683 | 9.03 | -13.03 | -5.03 |
| 9.039999999999681 | 9.04 | -13.04 | -5.04 |
| 9.049999999999683 | 9.05 | -13.05 | -5.05 |
| 9.05999999999968 | 9.06 | -13.06 | -5.06 |
| 9.06999999999968 | 9.07 | -13.07 | -5.07 |
| 9.07999999999968 | 9.08 | -13.08 | -5.08 |
| 9.08999999999968 | 9.09 | -13.09 | -5.09 |
| 9.09999999999968 | 9.1 | -13.1 | -5.1 |
| 9.10999999999968 | 9.11 | -13.11 | -5.11 |
| 9.11999999999968 | 9.12 | -13.12 | -5.12 |
| 9.12999999999968 | 9.13 | -13.13 | -5.13 |
| 9.13999999999968 | 9.14 | -13.14 | -5.14 |
| 9.14999999999968 | 9.15 | -13.15 | -5.15 |
| 9.15999999999968 | 9.16 | -13.16 | -5.16 |
| 9.16999999999968 | 9.17 | -13.17 | -5.17 |
| 9.17999999999968 | 9.18 | -13.18 | -5.18 |
| 9.18999999999968 | 9.19 | -13.19 | -5.19 |
| 9.19999999999968 | 9.2 | -13.2 | -5.2 |
| 9.20999999999968 | 9.21 | -13.21 | -5.21 |
| 9.21999999999968 | 9.22 | -13.22 | -5.22 |
| 9.229999999999677 | 9.23 | -13.23 | -5.23 |
| 9.239999999999679 | 9.24 | -13.24 | -5.24 |
| 9.249999999999678 | 9.25 | -13.25 | -5.25 |
| 9.259999999999678 | 9.26 | -13.26 | -5.26 |
| 9.269999999999678 | 9.27 | -13.27 | -5.27 |
| 9.279999999999678 | 9.28 | -13.28 | -5.28 |
| 9.289999999999678 | 9.29 | -13.29 | -5.29 |
| 9.299999999999677 | 9.3 | -13.3 | -5.3 |
| 9.309999999999677 | 9.31 | -13.31 | -5.31 |
| 9.319999999999675 | 9.32 | -13.32 | -5.32 |
| 9.329999999999677 | 9.33 | -13.33 | -5.33 |
| 9.339999999999677 | 9.34 | -13.34 | -5.34 |
| 9.349999999999676 | 9.35 | -13.35 | -5.35 |
| 9.359999999999676 | 9.36 | -13.36 | -5.36 |
| 9.369999999999674 | 9.37 | -13.37 | -5.37 |
| 9.379999999999676 | 9.38 | -13.38 | -5.38 |
| 9.389999999999675 | 9.39 | -13.39 | -5.39 |
| 9.399999999999675 | 9.4 | -13.4 | -5.4 |
| 9.409999999999675 | 9.41 | -13.41 | -5.41 |
| 9.419999999999675 | 9.42 | -13.42 | -5.42 |
| 9.429999999999675 | 9.43 | -13.43 | -5.43 |
| 9.439999999999674 | 9.44 | -13.44 | -5.44 |
| 9.449999999999674 | 9.45 | -13.45 | -5.45 |
| 9.459999999999672 | 9.46 | -13.46 | -5.46 |
| 9.469999999999674 | 9.47 | -13.47 | -5.47 |
| 9.479999999999674 | 9.48 | -13.48 | -5.48 |
| 9.489999999999673 | 9.49 | -13.49 | -5.49 |
| 9.499999999999673 | 9.5 | -13.5 | -5.5 |
| 9.509999999999671 | 9.51 | -13.51 | -5.51 |
| 9.519999999999673 | 9.52 | -13.52 | -5.52 |
| 9.529999999999673 | 9.53 | -13.53 | -5.53 |
| 9.539999999999672 | 9.54 | -13.54 | -5.54 |
| 9.549999999999672 | 9.55 | -13.55 | -5.55 |
| 9.55999999999967 | 9.56 | -13.56 | -5.56 |
| 9.56999999999967 | 9.57 | -13.57 | -5.57 |
| 9.57999999999967 | 9.58 | -13.58 | -5.58 |
| 9.58999999999967 | 9.59 | -13.59 | -5.59 |
| 9.59999999999967 | 9.6 | -13.6 | -5.6 |
| 9.60999999999967 | 9.61 | -13.61 | -5.61 |
| 9.61999999999967 | 9.62 | -13.62 | -5.62 |
| 9.62999999999967 | 9.63 | -13.63 | -5.63 |
| 9.63999999999967 | 9.64 | -13.64 | -5.64 |
| 9.64999999999967 | 9.65 | -13.65 | -5.65 |
| 9.65999999999967 | 9.66 | -13.66 | -5.66 |
| 9.66999999999967 | 9.67 | -13.67 | -5.67 |
| 9.67999999999967 | 9.68 | -13.68 | -5.68 |
| 9.689999999999667 | 9.69 | -13.69 | -5.69 |
| 9.699999999999669 | 9.7 | -13.7 | -5.7 |
| 9.709999999999669 | 9.71 | -13.71 | -5.71 |
| 9.719999999999668 | 9.72 | -13.72 | -5.72 |
| 9.729999999999668 | 9.73 | -13.73 | -5.73 |
| 9.739999999999666 | 9.74 | -13.74 | -5.74 |
| 9.749999999999668 | 9.75 | -13.75 | -5.75 |
| 9.759999999999668 | 9.76 | -13.76 | -5.76 |
| 9.769999999999667 | 9.77 | -13.77 | -5.77 |
| 9.779999999999667 | 9.78 | -13.78 | -5.78 |
| 9.789999999999665 | 9.79 | -13.79 | -5.79 |
| 9.799999999999667 | 9.8 | -13.8 | -5.8 |
| 9.809999999999667 | 9.81 | -13.81 | -5.81 |
| 9.819999999999666 | 9.82 | -13.82 | -5.82 |
| 9.829999999999666 | 9.83 | -13.83 | -5.83 |
| 9.839999999999664 | 9.84 | -13.84 | -5.84 |
| 9.849999999999666 | 9.85 | -13.85 | -5.85 |
| 9.859999999999665 | 9.86 | -13.86 | -5.86 |
| 9.869999999999665 | 9.87 | -13.87 | -5.87 |
| 9.879999999999663 | 9.88 | -13.88 | -5.88 |
| 9.889999999999665 | 9.89 | -13.89 | -5.89 |
| 9.899999999999665 | 9.9 | -13.9 | -5.9 |
| 9.909999999999664 | 9.91 | -13.91 | -5.91 |
| 9.919999999999664 | 9.92 | -13.92 | -5.92 |
| 9.929999999999662 | 9.93 | -13.93 | -5.93 |
| 9.939999999999664 | 9.94 | -13.94 | -5.94 |
| 9.949999999999664 | 9.95 | -13.95 | -5.95 |
| 9.95999999999966 | 9.96 | -13.96 | -5.96 |
| 9.96999999999966 | 9.97 | -13.97 | -5.97 |
| 9.97999999999966 | 9.98 | -13.98 | -5.98 |
| 9.98999999999966 | 9.99 | -13.99 | -5.99 |
| 9.99999999999966 | 10 | -14 | -6 |